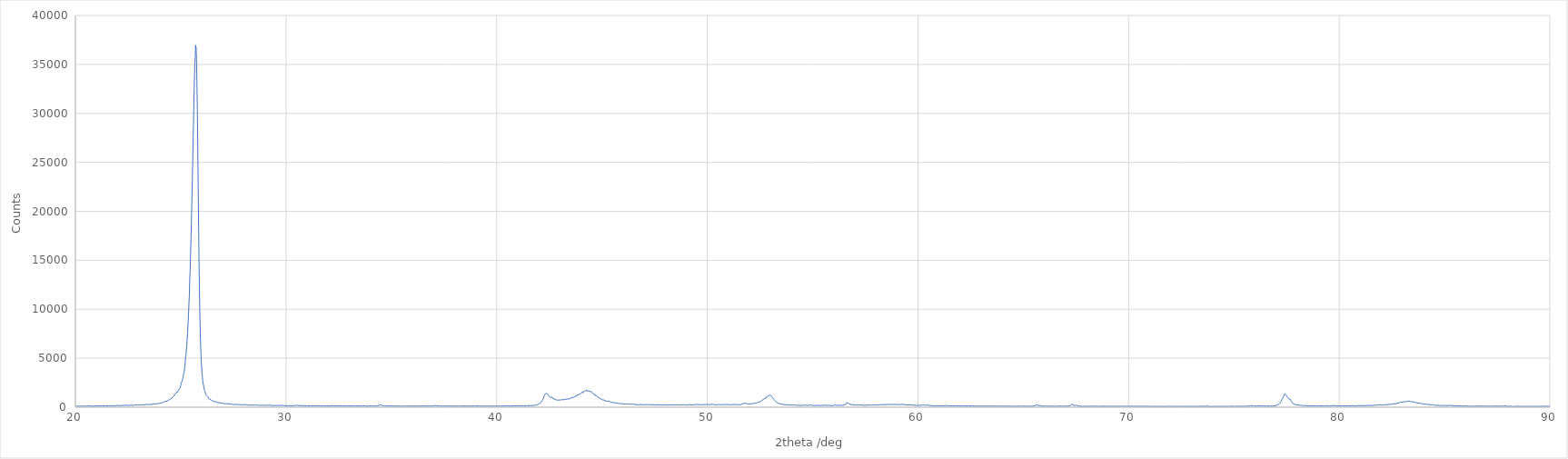
| Category | [Measurement conditions] |
|---|---|
| 20.01 | 100 |
| 20.03 | 119 |
| 20.05 | 104 |
| 20.07 | 100 |
| 20.09 | 97 |
| 20.11 | 107 |
| 20.13 | 111 |
| 20.15 | 119 |
| 20.17 | 114 |
| 20.19 | 95 |
| 20.21 | 114 |
| 20.23 | 109 |
| 20.25 | 108 |
| 20.27 | 118 |
| 20.29 | 110 |
| 20.31 | 104 |
| 20.33 | 119 |
| 20.35 | 124 |
| 20.37 | 110 |
| 20.39 | 112 |
| 20.41 | 109 |
| 20.43 | 108 |
| 20.45 | 116 |
| 20.47 | 116 |
| 20.49 | 112 |
| 20.51 | 124 |
| 20.53 | 116 |
| 20.55 | 118 |
| 20.57 | 122 |
| 20.59 | 120 |
| 20.61 | 127 |
| 20.63 | 111 |
| 20.65 | 111 |
| 20.67 | 140 |
| 20.69 | 94 |
| 20.71 | 104 |
| 20.73 | 120 |
| 20.75 | 124 |
| 20.77 | 104 |
| 20.79 | 112 |
| 20.81 | 121 |
| 20.83 | 124 |
| 20.85 | 101 |
| 20.87 | 110 |
| 20.89 | 126 |
| 20.91 | 131 |
| 20.93 | 131 |
| 20.95 | 137 |
| 20.97 | 137 |
| 20.99 | 138 |
| 21.01 | 127 |
| 21.03 | 133 |
| 21.05 | 108 |
| 21.07 | 126 |
| 21.09 | 129 |
| 21.11 | 141 |
| 21.13 | 162 |
| 21.15 | 130 |
| 21.17 | 116 |
| 21.19 | 126 |
| 21.21 | 135 |
| 21.23 | 138 |
| 21.25 | 140 |
| 21.27 | 138 |
| 21.29 | 144 |
| 21.31 | 130 |
| 21.33 | 149 |
| 21.35 | 144 |
| 21.37 | 136 |
| 21.39 | 143 |
| 21.41 | 134 |
| 21.43 | 130 |
| 21.45 | 149 |
| 21.47 | 131 |
| 21.49 | 139 |
| 21.51 | 129 |
| 21.53 | 164 |
| 21.55 | 135 |
| 21.57 | 132 |
| 21.59 | 150 |
| 21.61 | 140 |
| 21.63 | 133 |
| 21.65 | 133 |
| 21.67 | 155 |
| 21.69 | 158 |
| 21.71 | 154 |
| 21.73 | 169 |
| 21.75 | 151 |
| 21.77 | 165 |
| 21.79 | 153 |
| 21.81 | 151 |
| 21.83 | 148 |
| 21.85 | 135 |
| 21.87 | 141 |
| 21.89 | 146 |
| 21.91 | 162 |
| 21.93 | 162 |
| 21.95 | 179 |
| 21.97 | 144 |
| 21.99 | 187 |
| 22.01 | 144 |
| 22.03 | 152 |
| 22.05 | 159 |
| 22.07 | 139 |
| 22.09 | 185 |
| 22.11 | 164 |
| 22.13 | 171 |
| 22.15 | 165 |
| 22.17 | 165 |
| 22.19 | 166 |
| 22.21 | 186 |
| 22.23 | 177 |
| 22.25 | 176 |
| 22.27 | 154 |
| 22.29 | 176 |
| 22.31 | 187 |
| 22.33 | 185 |
| 22.35 | 193 |
| 22.37 | 160 |
| 22.39 | 163 |
| 22.41 | 197 |
| 22.43 | 175 |
| 22.45 | 171 |
| 22.47 | 176 |
| 22.49 | 205 |
| 22.51 | 194 |
| 22.53 | 172 |
| 22.55 | 178 |
| 22.57 | 182 |
| 22.59 | 203 |
| 22.61 | 195 |
| 22.63 | 199 |
| 22.65 | 204 |
| 22.67 | 214 |
| 22.69 | 213 |
| 22.71 | 187 |
| 22.73 | 229 |
| 22.75 | 227 |
| 22.77 | 187 |
| 22.79 | 196 |
| 22.81 | 213 |
| 22.83 | 247 |
| 22.85 | 228 |
| 22.87 | 226 |
| 22.89 | 218 |
| 22.91 | 214 |
| 22.93 | 226 |
| 22.95 | 230 |
| 22.97 | 277 |
| 22.99 | 211 |
| 23.01 | 226 |
| 23.03 | 228 |
| 23.05 | 236 |
| 23.07 | 227 |
| 23.09 | 259 |
| 23.11 | 269 |
| 23.13 | 240 |
| 23.15 | 263 |
| 23.17 | 222 |
| 23.19 | 255 |
| 23.21 | 268 |
| 23.23 | 262 |
| 23.25 | 240 |
| 23.27 | 260 |
| 23.29 | 276 |
| 23.31 | 263 |
| 23.33 | 261 |
| 23.35 | 244 |
| 23.37 | 292 |
| 23.39 | 245 |
| 23.41 | 271 |
| 23.43 | 260 |
| 23.45 | 253 |
| 23.47 | 269 |
| 23.49 | 264 |
| 23.51 | 297 |
| 23.53 | 262 |
| 23.55 | 288 |
| 23.57 | 294 |
| 23.59 | 269 |
| 23.61 | 278 |
| 23.63 | 286 |
| 23.65 | 318 |
| 23.67 | 319 |
| 23.69 | 358 |
| 23.71 | 335 |
| 23.73 | 362 |
| 23.75 | 347 |
| 23.77 | 347 |
| 23.79 | 321 |
| 23.81 | 333 |
| 23.83 | 370 |
| 23.85 | 355 |
| 23.87 | 402 |
| 23.89 | 367 |
| 23.91 | 346 |
| 23.93 | 393 |
| 23.95 | 426 |
| 23.97 | 387 |
| 23.99 | 412 |
| 24.01 | 412 |
| 24.03 | 409 |
| 24.05 | 395 |
| 24.07 | 427 |
| 24.09 | 433 |
| 24.11 | 459 |
| 24.13 | 504 |
| 24.15 | 487 |
| 24.17 | 434 |
| 24.19 | 497 |
| 24.21 | 532 |
| 24.23 | 526 |
| 24.25 | 508 |
| 24.27 | 591 |
| 24.29 | 543 |
| 24.31 | 614 |
| 24.33 | 613 |
| 24.35 | 620 |
| 24.37 | 662 |
| 24.39 | 678 |
| 24.41 | 710 |
| 24.43 | 753 |
| 24.45 | 758 |
| 24.47 | 754 |
| 24.49 | 773 |
| 24.51 | 820 |
| 24.53 | 845 |
| 24.55 | 912 |
| 24.57 | 922 |
| 24.59 | 951 |
| 24.61 | 987 |
| 24.63 | 1048 |
| 24.65 | 1128 |
| 24.67 | 1146 |
| 24.69 | 1217 |
| 24.71 | 1240 |
| 24.73 | 1336 |
| 24.75 | 1358 |
| 24.77 | 1365 |
| 24.79 | 1507 |
| 24.81 | 1575 |
| 24.83 | 1573 |
| 24.85 | 1535 |
| 24.87 | 1593 |
| 24.89 | 1741 |
| 24.91 | 1757 |
| 24.93 | 1862 |
| 24.95 | 1945 |
| 24.97 | 1970 |
| 24.99 | 2146 |
| 25.01 | 2261 |
| 25.03 | 2454 |
| 25.05 | 2522 |
| 25.07 | 2720 |
| 25.09 | 2877 |
| 25.11 | 3019 |
| 25.13 | 3351 |
| 25.15 | 3506 |
| 25.17 | 3663 |
| 25.19 | 4078 |
| 25.21 | 4454 |
| 25.23 | 5103 |
| 25.25 | 5347 |
| 25.27 | 5928 |
| 25.29 | 6325 |
| 25.31 | 7133 |
| 25.33 | 7672 |
| 25.35 | 8624 |
| 25.37 | 9398 |
| 25.39 | 10587 |
| 25.41 | 11391 |
| 25.43 | 13116 |
| 25.45 | 14067 |
| 25.47 | 15976 |
| 25.49 | 17316 |
| 25.51 | 19129 |
| 25.53 | 21165 |
| 25.55 | 23058 |
| 25.57 | 25038 |
| 25.59 | 27614 |
| 25.61 | 29217 |
| 25.63 | 31694 |
| 25.65 | 33254 |
| 25.67 | 35062 |
| 25.69 | 35752 |
| 25.71 | 36962 |
| 25.73 | 36573 |
| 25.75 | 35511 |
| 25.77 | 33069 |
| 25.79 | 30374 |
| 25.81 | 26295 |
| 25.83 | 22354 |
| 25.85 | 18491 |
| 25.87 | 14773 |
| 25.89 | 11864 |
| 25.91 | 9457 |
| 25.93 | 7427 |
| 25.95 | 6044 |
| 25.97 | 4993 |
| 25.99 | 4187 |
| 26.01 | 3417 |
| 26.03 | 3110 |
| 26.05 | 2610 |
| 26.07 | 2356 |
| 26.09 | 2163 |
| 26.11 | 1873 |
| 26.13 | 1746 |
| 26.15 | 1603 |
| 26.17 | 1477 |
| 26.19 | 1381 |
| 26.21 | 1247 |
| 26.23 | 1232 |
| 26.25 | 1147 |
| 26.27 | 1061 |
| 26.29 | 1040 |
| 26.31 | 1001 |
| 26.33 | 911 |
| 26.35 | 876 |
| 26.37 | 808 |
| 26.39 | 854 |
| 26.41 | 824 |
| 26.43 | 772 |
| 26.45 | 732 |
| 26.47 | 675 |
| 26.49 | 695 |
| 26.51 | 695 |
| 26.53 | 632 |
| 26.55 | 629 |
| 26.57 | 620 |
| 26.59 | 554 |
| 26.61 | 539 |
| 26.63 | 582 |
| 26.65 | 564 |
| 26.67 | 500 |
| 26.69 | 551 |
| 26.71 | 522 |
| 26.73 | 517 |
| 26.75 | 472 |
| 26.77 | 460 |
| 26.79 | 481 |
| 26.81 | 472 |
| 26.83 | 444 |
| 26.85 | 484 |
| 26.87 | 452 |
| 26.89 | 439 |
| 26.91 | 429 |
| 26.93 | 415 |
| 26.95 | 407 |
| 26.97 | 410 |
| 26.99 | 396 |
| 27.01 | 402 |
| 27.03 | 370 |
| 27.05 | 332 |
| 27.07 | 362 |
| 27.09 | 366 |
| 27.11 | 393 |
| 27.13 | 339 |
| 27.15 | 364 |
| 27.17 | 379 |
| 27.19 | 378 |
| 27.21 | 384 |
| 27.23 | 337 |
| 27.25 | 330 |
| 27.27 | 347 |
| 27.29 | 335 |
| 27.31 | 352 |
| 27.33 | 322 |
| 27.35 | 295 |
| 27.37 | 321 |
| 27.39 | 332 |
| 27.41 | 338 |
| 27.43 | 300 |
| 27.45 | 279 |
| 27.47 | 329 |
| 27.49 | 264 |
| 27.51 | 293 |
| 27.53 | 262 |
| 27.55 | 278 |
| 27.57 | 275 |
| 27.59 | 292 |
| 27.61 | 273 |
| 27.63 | 273 |
| 27.65 | 273 |
| 27.67 | 296 |
| 27.69 | 288 |
| 27.71 | 254 |
| 27.73 | 240 |
| 27.75 | 253 |
| 27.77 | 267 |
| 27.79 | 261 |
| 27.81 | 270 |
| 27.83 | 264 |
| 27.85 | 267 |
| 27.87 | 278 |
| 27.89 | 237 |
| 27.91 | 219 |
| 27.93 | 280 |
| 27.95 | 248 |
| 27.97 | 250 |
| 27.99 | 273 |
| 28.01 | 220 |
| 28.03 | 257 |
| 28.05 | 238 |
| 28.07 | 230 |
| 28.09 | 264 |
| 28.11 | 248 |
| 28.13 | 227 |
| 28.15 | 231 |
| 28.17 | 216 |
| 28.19 | 213 |
| 28.21 | 212 |
| 28.23 | 217 |
| 28.25 | 206 |
| 28.27 | 193 |
| 28.29 | 219 |
| 28.31 | 235 |
| 28.33 | 222 |
| 28.35 | 194 |
| 28.37 | 237 |
| 28.39 | 206 |
| 28.41 | 221 |
| 28.43 | 196 |
| 28.45 | 201 |
| 28.47 | 219 |
| 28.49 | 229 |
| 28.51 | 228 |
| 28.53 | 204 |
| 28.55 | 205 |
| 28.57 | 213 |
| 28.59 | 207 |
| 28.61 | 215 |
| 28.63 | 214 |
| 28.65 | 231 |
| 28.67 | 199 |
| 28.69 | 200 |
| 28.71 | 198 |
| 28.73 | 182 |
| 28.75 | 171 |
| 28.77 | 230 |
| 28.79 | 194 |
| 28.81 | 205 |
| 28.83 | 202 |
| 28.85 | 202 |
| 28.87 | 213 |
| 28.89 | 200 |
| 28.91 | 221 |
| 28.93 | 183 |
| 28.95 | 209 |
| 28.97 | 200 |
| 28.99 | 205 |
| 29.01 | 210 |
| 29.03 | 195 |
| 29.05 | 179 |
| 29.07 | 185 |
| 29.09 | 173 |
| 29.11 | 198 |
| 29.13 | 144 |
| 29.15 | 198 |
| 29.17 | 206 |
| 29.19 | 174 |
| 29.21 | 189 |
| 29.23 | 203 |
| 29.25 | 179 |
| 29.27 | 158 |
| 29.29 | 192 |
| 29.31 | 171 |
| 29.33 | 174 |
| 29.35 | 161 |
| 29.37 | 177 |
| 29.39 | 170 |
| 29.41 | 173 |
| 29.43 | 149 |
| 29.45 | 173 |
| 29.47 | 157 |
| 29.49 | 177 |
| 29.51 | 186 |
| 29.53 | 195 |
| 29.55 | 177 |
| 29.57 | 164 |
| 29.59 | 157 |
| 29.61 | 193 |
| 29.63 | 178 |
| 29.65 | 179 |
| 29.67 | 134 |
| 29.69 | 147 |
| 29.71 | 155 |
| 29.73 | 164 |
| 29.75 | 171 |
| 29.77 | 194 |
| 29.79 | 176 |
| 29.81 | 164 |
| 29.83 | 189 |
| 29.85 | 170 |
| 29.87 | 159 |
| 29.89 | 171 |
| 29.91 | 163 |
| 29.93 | 172 |
| 29.95 | 161 |
| 29.97 | 149 |
| 29.99 | 144 |
| 30.01 | 139 |
| 30.03 | 150 |
| 30.05 | 159 |
| 30.07 | 149 |
| 30.09 | 151 |
| 30.11 | 159 |
| 30.13 | 149 |
| 30.15 | 173 |
| 30.17 | 139 |
| 30.19 | 164 |
| 30.21 | 145 |
| 30.23 | 152 |
| 30.25 | 142 |
| 30.27 | 147 |
| 30.29 | 179 |
| 30.31 | 165 |
| 30.33 | 149 |
| 30.35 | 160 |
| 30.37 | 142 |
| 30.39 | 120 |
| 30.41 | 168 |
| 30.43 | 187 |
| 30.45 | 144 |
| 30.47 | 163 |
| 30.49 | 177 |
| 30.51 | 142 |
| 30.53 | 143 |
| 30.55 | 189 |
| 30.57 | 141 |
| 30.59 | 158 |
| 30.61 | 165 |
| 30.63 | 149 |
| 30.65 | 141 |
| 30.67 | 175 |
| 30.69 | 165 |
| 30.71 | 149 |
| 30.73 | 133 |
| 30.75 | 132 |
| 30.77 | 142 |
| 30.79 | 162 |
| 30.81 | 163 |
| 30.83 | 149 |
| 30.85 | 168 |
| 30.87 | 126 |
| 30.89 | 145 |
| 30.91 | 132 |
| 30.93 | 145 |
| 30.95 | 135 |
| 30.97 | 142 |
| 30.99 | 146 |
| 31.01 | 134 |
| 31.03 | 132 |
| 31.05 | 144 |
| 31.07 | 149 |
| 31.09 | 154 |
| 31.11 | 151 |
| 31.13 | 137 |
| 31.15 | 137 |
| 31.17 | 133 |
| 31.19 | 146 |
| 31.21 | 136 |
| 31.23 | 151 |
| 31.25 | 135 |
| 31.27 | 140 |
| 31.29 | 144 |
| 31.31 | 145 |
| 31.33 | 159 |
| 31.35 | 140 |
| 31.37 | 130 |
| 31.39 | 136 |
| 31.41 | 141 |
| 31.43 | 163 |
| 31.45 | 139 |
| 31.47 | 141 |
| 31.49 | 143 |
| 31.51 | 155 |
| 31.53 | 132 |
| 31.55 | 123 |
| 31.57 | 138 |
| 31.59 | 146 |
| 31.61 | 120 |
| 31.63 | 149 |
| 31.65 | 132 |
| 31.67 | 157 |
| 31.69 | 128 |
| 31.71 | 117 |
| 31.73 | 161 |
| 31.75 | 129 |
| 31.77 | 167 |
| 31.79 | 122 |
| 31.81 | 131 |
| 31.83 | 135 |
| 31.85 | 146 |
| 31.87 | 128 |
| 31.89 | 160 |
| 31.91 | 134 |
| 31.93 | 133 |
| 31.95 | 145 |
| 31.97 | 127 |
| 31.99 | 132 |
| 32.01 | 128 |
| 32.03 | 122 |
| 32.05 | 111 |
| 32.07 | 130 |
| 32.09 | 143 |
| 32.11 | 143 |
| 32.13 | 119 |
| 32.15 | 159 |
| 32.17 | 163 |
| 32.19 | 121 |
| 32.21 | 139 |
| 32.23 | 131 |
| 32.25 | 122 |
| 32.27 | 131 |
| 32.29 | 140 |
| 32.31 | 135 |
| 32.33 | 125 |
| 32.35 | 152 |
| 32.37 | 133 |
| 32.39 | 147 |
| 32.41 | 137 |
| 32.43 | 141 |
| 32.45 | 125 |
| 32.47 | 125 |
| 32.49 | 108 |
| 32.51 | 129 |
| 32.53 | 126 |
| 32.55 | 117 |
| 32.57 | 117 |
| 32.59 | 150 |
| 32.61 | 134 |
| 32.63 | 134 |
| 32.65 | 106 |
| 32.67 | 128 |
| 32.69 | 125 |
| 32.71 | 131 |
| 32.73 | 160 |
| 32.75 | 137 |
| 32.77 | 151 |
| 32.79 | 124 |
| 32.81 | 137 |
| 32.83 | 109 |
| 32.85 | 126 |
| 32.87 | 126 |
| 32.89 | 130 |
| 32.91 | 143 |
| 32.93 | 152 |
| 32.95 | 130 |
| 32.97 | 118 |
| 32.99 | 110 |
| 33.01 | 135 |
| 33.03 | 134 |
| 33.05 | 115 |
| 33.07 | 140 |
| 33.09 | 122 |
| 33.11 | 143 |
| 33.13 | 108 |
| 33.15 | 123 |
| 33.17 | 132 |
| 33.19 | 133 |
| 33.21 | 101 |
| 33.23 | 120 |
| 33.25 | 110 |
| 33.27 | 141 |
| 33.29 | 129 |
| 33.31 | 136 |
| 33.33 | 123 |
| 33.35 | 128 |
| 33.37 | 127 |
| 33.39 | 124 |
| 33.41 | 117 |
| 33.43 | 130 |
| 33.45 | 101 |
| 33.47 | 118 |
| 33.49 | 141 |
| 33.51 | 104 |
| 33.53 | 132 |
| 33.55 | 124 |
| 33.57 | 116 |
| 33.59 | 121 |
| 33.61 | 105 |
| 33.63 | 120 |
| 33.65 | 115 |
| 33.67 | 136 |
| 33.69 | 143 |
| 33.71 | 128 |
| 33.73 | 142 |
| 33.75 | 115 |
| 33.77 | 131 |
| 33.79 | 118 |
| 33.81 | 114 |
| 33.83 | 129 |
| 33.85 | 113 |
| 33.87 | 121 |
| 33.89 | 117 |
| 33.91 | 100 |
| 33.93 | 139 |
| 33.95 | 139 |
| 33.97 | 122 |
| 33.99 | 124 |
| 34.01 | 133 |
| 34.03 | 145 |
| 34.05 | 135 |
| 34.07 | 113 |
| 34.09 | 115 |
| 34.11 | 100 |
| 34.13 | 124 |
| 34.15 | 118 |
| 34.17 | 129 |
| 34.19 | 136 |
| 34.21 | 117 |
| 34.23 | 133 |
| 34.25 | 119 |
| 34.27 | 125 |
| 34.29 | 133 |
| 34.31 | 157 |
| 34.33 | 148 |
| 34.35 | 134 |
| 34.37 | 148 |
| 34.39 | 171 |
| 34.41 | 177 |
| 34.43 | 201 |
| 34.45 | 223 |
| 34.47 | 217 |
| 34.49 | 221 |
| 34.51 | 218 |
| 34.53 | 206 |
| 34.55 | 191 |
| 34.57 | 177 |
| 34.59 | 154 |
| 34.61 | 151 |
| 34.63 | 160 |
| 34.65 | 129 |
| 34.67 | 133 |
| 34.69 | 122 |
| 34.71 | 135 |
| 34.73 | 131 |
| 34.75 | 120 |
| 34.77 | 114 |
| 34.79 | 112 |
| 34.81 | 109 |
| 34.83 | 142 |
| 34.85 | 121 |
| 34.87 | 128 |
| 34.89 | 109 |
| 34.91 | 127 |
| 34.93 | 139 |
| 34.95 | 129 |
| 34.97 | 110 |
| 34.99 | 136 |
| 35.01 | 106 |
| 35.03 | 127 |
| 35.05 | 116 |
| 35.07 | 134 |
| 35.09 | 103 |
| 35.11 | 124 |
| 35.13 | 117 |
| 35.15 | 122 |
| 35.17 | 112 |
| 35.19 | 127 |
| 35.21 | 109 |
| 35.23 | 111 |
| 35.25 | 130 |
| 35.27 | 119 |
| 35.29 | 134 |
| 35.31 | 136 |
| 35.33 | 127 |
| 35.35 | 125 |
| 35.37 | 129 |
| 35.39 | 121 |
| 35.41 | 92 |
| 35.43 | 121 |
| 35.45 | 113 |
| 35.47 | 112 |
| 35.49 | 112 |
| 35.51 | 128 |
| 35.53 | 104 |
| 35.55 | 117 |
| 35.57 | 133 |
| 35.59 | 108 |
| 35.61 | 121 |
| 35.63 | 126 |
| 35.65 | 118 |
| 35.67 | 121 |
| 35.69 | 125 |
| 35.71 | 114 |
| 35.73 | 121 |
| 35.75 | 102 |
| 35.77 | 130 |
| 35.79 | 123 |
| 35.81 | 102 |
| 35.83 | 115 |
| 35.85 | 136 |
| 35.87 | 145 |
| 35.89 | 104 |
| 35.91 | 124 |
| 35.93 | 111 |
| 35.95 | 121 |
| 35.97 | 108 |
| 35.99 | 132 |
| 36.01 | 113 |
| 36.03 | 146 |
| 36.05 | 125 |
| 36.07 | 118 |
| 36.09 | 136 |
| 36.11 | 132 |
| 36.13 | 111 |
| 36.15 | 134 |
| 36.17 | 114 |
| 36.19 | 126 |
| 36.21 | 125 |
| 36.23 | 117 |
| 36.25 | 104 |
| 36.27 | 136 |
| 36.29 | 122 |
| 36.31 | 106 |
| 36.33 | 116 |
| 36.35 | 112 |
| 36.37 | 126 |
| 36.39 | 139 |
| 36.41 | 120 |
| 36.43 | 131 |
| 36.45 | 131 |
| 36.47 | 127 |
| 36.49 | 133 |
| 36.51 | 107 |
| 36.53 | 115 |
| 36.55 | 126 |
| 36.57 | 104 |
| 36.59 | 136 |
| 36.61 | 120 |
| 36.63 | 137 |
| 36.65 | 115 |
| 36.67 | 112 |
| 36.69 | 136 |
| 36.71 | 120 |
| 36.73 | 120 |
| 36.75 | 132 |
| 36.77 | 119 |
| 36.79 | 111 |
| 36.81 | 116 |
| 36.83 | 124 |
| 36.85 | 149 |
| 36.87 | 116 |
| 36.89 | 125 |
| 36.91 | 118 |
| 36.93 | 110 |
| 36.95 | 127 |
| 36.97 | 122 |
| 36.99 | 121 |
| 37.01 | 150 |
| 37.03 | 144 |
| 37.05 | 144 |
| 37.07 | 181 |
| 37.09 | 186 |
| 37.11 | 185 |
| 37.13 | 171 |
| 37.15 | 162 |
| 37.17 | 182 |
| 37.19 | 156 |
| 37.21 | 138 |
| 37.23 | 141 |
| 37.25 | 150 |
| 37.27 | 118 |
| 37.29 | 140 |
| 37.31 | 120 |
| 37.33 | 133 |
| 37.35 | 117 |
| 37.37 | 110 |
| 37.39 | 114 |
| 37.41 | 116 |
| 37.43 | 110 |
| 37.45 | 116 |
| 37.47 | 121 |
| 37.49 | 108 |
| 37.51 | 115 |
| 37.53 | 113 |
| 37.55 | 115 |
| 37.57 | 120 |
| 37.59 | 115 |
| 37.61 | 104 |
| 37.63 | 124 |
| 37.65 | 106 |
| 37.67 | 104 |
| 37.69 | 113 |
| 37.71 | 114 |
| 37.73 | 121 |
| 37.75 | 125 |
| 37.77 | 111 |
| 37.79 | 116 |
| 37.81 | 125 |
| 37.83 | 105 |
| 37.85 | 121 |
| 37.87 | 123 |
| 37.89 | 116 |
| 37.91 | 134 |
| 37.93 | 110 |
| 37.95 | 112 |
| 37.97 | 117 |
| 37.99 | 107 |
| 38.01 | 107 |
| 38.03 | 127 |
| 38.05 | 133 |
| 38.07 | 132 |
| 38.09 | 130 |
| 38.11 | 115 |
| 38.13 | 128 |
| 38.15 | 103 |
| 38.17 | 86 |
| 38.19 | 119 |
| 38.21 | 101 |
| 38.23 | 130 |
| 38.25 | 119 |
| 38.27 | 120 |
| 38.29 | 104 |
| 38.31 | 122 |
| 38.33 | 104 |
| 38.35 | 117 |
| 38.37 | 135 |
| 38.39 | 104 |
| 38.41 | 139 |
| 38.43 | 125 |
| 38.45 | 122 |
| 38.47 | 110 |
| 38.49 | 116 |
| 38.51 | 136 |
| 38.53 | 130 |
| 38.55 | 130 |
| 38.57 | 95 |
| 38.59 | 110 |
| 38.61 | 123 |
| 38.63 | 130 |
| 38.65 | 103 |
| 38.67 | 130 |
| 38.69 | 130 |
| 38.71 | 122 |
| 38.73 | 127 |
| 38.75 | 112 |
| 38.77 | 124 |
| 38.79 | 105 |
| 38.81 | 120 |
| 38.83 | 121 |
| 38.85 | 124 |
| 38.87 | 114 |
| 38.89 | 124 |
| 38.91 | 130 |
| 38.93 | 124 |
| 38.95 | 124 |
| 38.97 | 121 |
| 38.99 | 115 |
| 39.01 | 105 |
| 39.03 | 131 |
| 39.05 | 115 |
| 39.07 | 153 |
| 39.09 | 119 |
| 39.11 | 116 |
| 39.13 | 127 |
| 39.15 | 125 |
| 39.17 | 123 |
| 39.19 | 108 |
| 39.21 | 106 |
| 39.23 | 114 |
| 39.25 | 100 |
| 39.27 | 121 |
| 39.29 | 112 |
| 39.31 | 114 |
| 39.33 | 127 |
| 39.35 | 129 |
| 39.37 | 110 |
| 39.39 | 116 |
| 39.41 | 114 |
| 39.43 | 115 |
| 39.45 | 132 |
| 39.47 | 118 |
| 39.49 | 120 |
| 39.51 | 124 |
| 39.53 | 120 |
| 39.55 | 105 |
| 39.57 | 138 |
| 39.59 | 140 |
| 39.61 | 126 |
| 39.63 | 107 |
| 39.65 | 117 |
| 39.67 | 97 |
| 39.69 | 118 |
| 39.71 | 112 |
| 39.73 | 127 |
| 39.75 | 122 |
| 39.77 | 128 |
| 39.79 | 109 |
| 39.81 | 111 |
| 39.83 | 117 |
| 39.85 | 124 |
| 39.87 | 121 |
| 39.89 | 111 |
| 39.91 | 115 |
| 39.93 | 119 |
| 39.95 | 127 |
| 39.97 | 96 |
| 39.99 | 112 |
| 40.01 | 107 |
| 40.03 | 118 |
| 40.05 | 116 |
| 40.07 | 115 |
| 40.09 | 115 |
| 40.11 | 123 |
| 40.13 | 149 |
| 40.15 | 110 |
| 40.17 | 134 |
| 40.19 | 119 |
| 40.21 | 113 |
| 40.23 | 121 |
| 40.25 | 114 |
| 40.27 | 126 |
| 40.29 | 150 |
| 40.31 | 111 |
| 40.33 | 103 |
| 40.35 | 150 |
| 40.37 | 120 |
| 40.39 | 124 |
| 40.41 | 145 |
| 40.43 | 125 |
| 40.45 | 132 |
| 40.47 | 135 |
| 40.49 | 129 |
| 40.51 | 145 |
| 40.53 | 126 |
| 40.55 | 126 |
| 40.57 | 130 |
| 40.59 | 106 |
| 40.61 | 132 |
| 40.63 | 108 |
| 40.65 | 149 |
| 40.67 | 145 |
| 40.69 | 126 |
| 40.71 | 129 |
| 40.73 | 137 |
| 40.75 | 128 |
| 40.77 | 140 |
| 40.79 | 136 |
| 40.81 | 145 |
| 40.83 | 142 |
| 40.85 | 133 |
| 40.87 | 136 |
| 40.89 | 153 |
| 40.91 | 163 |
| 40.93 | 134 |
| 40.95 | 139 |
| 40.97 | 136 |
| 40.99 | 154 |
| 41.01 | 139 |
| 41.03 | 143 |
| 41.05 | 141 |
| 41.07 | 124 |
| 41.09 | 157 |
| 41.11 | 145 |
| 41.13 | 142 |
| 41.15 | 138 |
| 41.17 | 139 |
| 41.19 | 130 |
| 41.21 | 163 |
| 41.23 | 145 |
| 41.25 | 126 |
| 41.27 | 158 |
| 41.29 | 143 |
| 41.31 | 142 |
| 41.33 | 154 |
| 41.35 | 150 |
| 41.37 | 121 |
| 41.39 | 148 |
| 41.41 | 138 |
| 41.43 | 154 |
| 41.45 | 157 |
| 41.47 | 161 |
| 41.49 | 159 |
| 41.51 | 146 |
| 41.53 | 155 |
| 41.55 | 159 |
| 41.57 | 156 |
| 41.59 | 161 |
| 41.61 | 163 |
| 41.63 | 171 |
| 41.65 | 163 |
| 41.67 | 169 |
| 41.69 | 167 |
| 41.71 | 177 |
| 41.73 | 152 |
| 41.75 | 200 |
| 41.77 | 173 |
| 41.79 | 185 |
| 41.81 | 211 |
| 41.83 | 208 |
| 41.85 | 183 |
| 41.87 | 189 |
| 41.89 | 220 |
| 41.91 | 223 |
| 41.93 | 221 |
| 41.95 | 275 |
| 41.97 | 269 |
| 41.99 | 305 |
| 42.01 | 354 |
| 42.03 | 318 |
| 42.05 | 392 |
| 42.07 | 401 |
| 42.09 | 435 |
| 42.11 | 527 |
| 42.13 | 595 |
| 42.15 | 664 |
| 42.17 | 713 |
| 42.19 | 796 |
| 42.21 | 869 |
| 42.23 | 1008 |
| 42.25 | 1104 |
| 42.27 | 1237 |
| 42.29 | 1300 |
| 42.31 | 1366 |
| 42.33 | 1457 |
| 42.35 | 1405 |
| 42.37 | 1418 |
| 42.39 | 1410 |
| 42.41 | 1331 |
| 42.43 | 1279 |
| 42.45 | 1179 |
| 42.47 | 1118 |
| 42.49 | 1087 |
| 42.51 | 1075 |
| 42.53 | 992 |
| 42.55 | 998 |
| 42.57 | 1006 |
| 42.59 | 1001 |
| 42.61 | 992 |
| 42.63 | 1029 |
| 42.65 | 998 |
| 42.67 | 883 |
| 42.69 | 865 |
| 42.71 | 857 |
| 42.73 | 871 |
| 42.75 | 778 |
| 42.77 | 793 |
| 42.79 | 815 |
| 42.81 | 773 |
| 42.83 | 721 |
| 42.85 | 748 |
| 42.87 | 716 |
| 42.89 | 726 |
| 42.91 | 694 |
| 42.93 | 731 |
| 42.95 | 768 |
| 42.97 | 730 |
| 42.99 | 733 |
| 43.01 | 719 |
| 43.03 | 735 |
| 43.05 | 741 |
| 43.07 | 742 |
| 43.09 | 728 |
| 43.11 | 784 |
| 43.13 | 778 |
| 43.15 | 797 |
| 43.17 | 750 |
| 43.19 | 779 |
| 43.21 | 807 |
| 43.23 | 803 |
| 43.25 | 750 |
| 43.27 | 778 |
| 43.29 | 811 |
| 43.31 | 862 |
| 43.33 | 859 |
| 43.35 | 839 |
| 43.37 | 880 |
| 43.39 | 852 |
| 43.41 | 829 |
| 43.43 | 880 |
| 43.45 | 886 |
| 43.47 | 880 |
| 43.49 | 863 |
| 43.51 | 890 |
| 43.53 | 924 |
| 43.55 | 948 |
| 43.57 | 995 |
| 43.59 | 996 |
| 43.61 | 979 |
| 43.63 | 991 |
| 43.65 | 1004 |
| 43.67 | 1057 |
| 43.69 | 1011 |
| 43.71 | 1081 |
| 43.73 | 1078 |
| 43.75 | 1106 |
| 43.77 | 1109 |
| 43.79 | 1212 |
| 43.81 | 1203 |
| 43.83 | 1204 |
| 43.85 | 1208 |
| 43.87 | 1226 |
| 43.89 | 1309 |
| 43.91 | 1319 |
| 43.93 | 1341 |
| 43.95 | 1324 |
| 43.97 | 1390 |
| 43.99 | 1366 |
| 44.01 | 1436 |
| 44.03 | 1409 |
| 44.05 | 1424 |
| 44.07 | 1566 |
| 44.09 | 1432 |
| 44.11 | 1555 |
| 44.13 | 1542 |
| 44.15 | 1505 |
| 44.17 | 1657 |
| 44.19 | 1606 |
| 44.21 | 1718 |
| 44.23 | 1633 |
| 44.25 | 1672 |
| 44.27 | 1771 |
| 44.29 | 1660 |
| 44.31 | 1702 |
| 44.33 | 1622 |
| 44.35 | 1661 |
| 44.37 | 1645 |
| 44.39 | 1664 |
| 44.41 | 1629 |
| 44.43 | 1703 |
| 44.45 | 1623 |
| 44.47 | 1586 |
| 44.49 | 1555 |
| 44.51 | 1548 |
| 44.53 | 1505 |
| 44.55 | 1484 |
| 44.57 | 1461 |
| 44.59 | 1360 |
| 44.61 | 1320 |
| 44.63 | 1321 |
| 44.65 | 1347 |
| 44.67 | 1186 |
| 44.69 | 1212 |
| 44.71 | 1197 |
| 44.73 | 1179 |
| 44.75 | 1099 |
| 44.77 | 1090 |
| 44.79 | 1041 |
| 44.81 | 1061 |
| 44.83 | 1012 |
| 44.85 | 982 |
| 44.87 | 951 |
| 44.89 | 931 |
| 44.91 | 898 |
| 44.93 | 885 |
| 44.95 | 863 |
| 44.97 | 833 |
| 44.99 | 831 |
| 45.01 | 766 |
| 45.03 | 739 |
| 45.05 | 748 |
| 45.07 | 741 |
| 45.09 | 735 |
| 45.11 | 719 |
| 45.13 | 735 |
| 45.15 | 666 |
| 45.17 | 667 |
| 45.19 | 649 |
| 45.21 | 627 |
| 45.23 | 658 |
| 45.25 | 606 |
| 45.27 | 602 |
| 45.29 | 619 |
| 45.31 | 557 |
| 45.33 | 614 |
| 45.35 | 537 |
| 45.37 | 563 |
| 45.39 | 551 |
| 45.41 | 549 |
| 45.43 | 545 |
| 45.45 | 497 |
| 45.47 | 491 |
| 45.49 | 483 |
| 45.51 | 480 |
| 45.53 | 459 |
| 45.55 | 507 |
| 45.57 | 462 |
| 45.59 | 440 |
| 45.61 | 423 |
| 45.63 | 447 |
| 45.65 | 429 |
| 45.67 | 434 |
| 45.69 | 396 |
| 45.71 | 423 |
| 45.73 | 387 |
| 45.75 | 442 |
| 45.77 | 432 |
| 45.79 | 402 |
| 45.81 | 343 |
| 45.83 | 397 |
| 45.85 | 356 |
| 45.87 | 386 |
| 45.89 | 399 |
| 45.91 | 378 |
| 45.93 | 356 |
| 45.95 | 368 |
| 45.97 | 365 |
| 45.99 | 356 |
| 46.01 | 356 |
| 46.03 | 366 |
| 46.05 | 306 |
| 46.07 | 344 |
| 46.09 | 340 |
| 46.11 | 341 |
| 46.13 | 367 |
| 46.15 | 353 |
| 46.17 | 312 |
| 46.19 | 329 |
| 46.21 | 319 |
| 46.23 | 328 |
| 46.25 | 312 |
| 46.27 | 318 |
| 46.29 | 325 |
| 46.31 | 316 |
| 46.33 | 308 |
| 46.35 | 305 |
| 46.37 | 310 |
| 46.39 | 281 |
| 46.41 | 299 |
| 46.43 | 292 |
| 46.45 | 298 |
| 46.47 | 309 |
| 46.49 | 289 |
| 46.51 | 299 |
| 46.53 | 284 |
| 46.55 | 305 |
| 46.57 | 261 |
| 46.59 | 270 |
| 46.61 | 276 |
| 46.63 | 271 |
| 46.65 | 250 |
| 46.67 | 252 |
| 46.69 | 330 |
| 46.71 | 238 |
| 46.73 | 246 |
| 46.75 | 293 |
| 46.77 | 263 |
| 46.79 | 247 |
| 46.81 | 278 |
| 46.83 | 277 |
| 46.85 | 281 |
| 46.87 | 261 |
| 46.89 | 266 |
| 46.91 | 264 |
| 46.93 | 265 |
| 46.95 | 241 |
| 46.97 | 262 |
| 46.99 | 229 |
| 47.01 | 255 |
| 47.03 | 269 |
| 47.05 | 272 |
| 47.07 | 262 |
| 47.09 | 236 |
| 47.11 | 244 |
| 47.13 | 259 |
| 47.15 | 208 |
| 47.17 | 254 |
| 47.19 | 275 |
| 47.21 | 275 |
| 47.23 | 285 |
| 47.25 | 245 |
| 47.27 | 260 |
| 47.29 | 260 |
| 47.31 | 258 |
| 47.33 | 216 |
| 47.35 | 228 |
| 47.37 | 242 |
| 47.39 | 231 |
| 47.41 | 243 |
| 47.43 | 249 |
| 47.45 | 272 |
| 47.47 | 230 |
| 47.49 | 236 |
| 47.51 | 238 |
| 47.53 | 259 |
| 47.55 | 255 |
| 47.57 | 269 |
| 47.59 | 222 |
| 47.61 | 231 |
| 47.63 | 230 |
| 47.65 | 233 |
| 47.67 | 266 |
| 47.69 | 247 |
| 47.71 | 231 |
| 47.73 | 229 |
| 47.75 | 225 |
| 47.77 | 270 |
| 47.79 | 235 |
| 47.81 | 253 |
| 47.83 | 232 |
| 47.85 | 224 |
| 47.87 | 241 |
| 47.89 | 223 |
| 47.91 | 230 |
| 47.93 | 236 |
| 47.95 | 242 |
| 47.97 | 235 |
| 47.99 | 211 |
| 48.01 | 225 |
| 48.03 | 240 |
| 48.05 | 217 |
| 48.07 | 218 |
| 48.09 | 234 |
| 48.11 | 249 |
| 48.13 | 245 |
| 48.15 | 213 |
| 48.17 | 236 |
| 48.19 | 231 |
| 48.21 | 236 |
| 48.23 | 228 |
| 48.25 | 217 |
| 48.27 | 230 |
| 48.29 | 221 |
| 48.31 | 215 |
| 48.33 | 237 |
| 48.35 | 244 |
| 48.37 | 238 |
| 48.39 | 246 |
| 48.41 | 211 |
| 48.43 | 225 |
| 48.45 | 224 |
| 48.47 | 235 |
| 48.49 | 228 |
| 48.51 | 246 |
| 48.53 | 249 |
| 48.55 | 218 |
| 48.57 | 248 |
| 48.59 | 223 |
| 48.61 | 213 |
| 48.63 | 222 |
| 48.65 | 220 |
| 48.67 | 215 |
| 48.69 | 212 |
| 48.71 | 231 |
| 48.73 | 211 |
| 48.75 | 247 |
| 48.77 | 229 |
| 48.79 | 235 |
| 48.81 | 237 |
| 48.83 | 236 |
| 48.85 | 221 |
| 48.87 | 247 |
| 48.89 | 235 |
| 48.91 | 229 |
| 48.93 | 232 |
| 48.95 | 229 |
| 48.97 | 257 |
| 48.99 | 224 |
| 49.01 | 247 |
| 49.03 | 249 |
| 49.05 | 238 |
| 49.07 | 211 |
| 49.09 | 246 |
| 49.11 | 254 |
| 49.13 | 231 |
| 49.15 | 259 |
| 49.17 | 272 |
| 49.19 | 250 |
| 49.21 | 250 |
| 49.23 | 222 |
| 49.25 | 258 |
| 49.27 | 260 |
| 49.29 | 235 |
| 49.31 | 278 |
| 49.33 | 248 |
| 49.35 | 253 |
| 49.37 | 253 |
| 49.39 | 216 |
| 49.41 | 248 |
| 49.43 | 257 |
| 49.45 | 226 |
| 49.47 | 264 |
| 49.49 | 264 |
| 49.51 | 244 |
| 49.53 | 273 |
| 49.55 | 247 |
| 49.57 | 245 |
| 49.59 | 269 |
| 49.61 | 237 |
| 49.63 | 265 |
| 49.65 | 269 |
| 49.67 | 255 |
| 49.69 | 263 |
| 49.71 | 240 |
| 49.73 | 238 |
| 49.75 | 260 |
| 49.77 | 245 |
| 49.79 | 254 |
| 49.81 | 254 |
| 49.83 | 279 |
| 49.85 | 239 |
| 49.87 | 270 |
| 49.89 | 252 |
| 49.91 | 288 |
| 49.93 | 284 |
| 49.95 | 276 |
| 49.97 | 291 |
| 49.99 | 248 |
| 50.01 | 286 |
| 50.03 | 290 |
| 50.05 | 259 |
| 50.07 | 248 |
| 50.09 | 275 |
| 50.11 | 267 |
| 50.13 | 258 |
| 50.15 | 264 |
| 50.17 | 287 |
| 50.19 | 299 |
| 50.21 | 276 |
| 50.23 | 280 |
| 50.25 | 296 |
| 50.27 | 268 |
| 50.29 | 287 |
| 50.31 | 277 |
| 50.33 | 283 |
| 50.35 | 252 |
| 50.37 | 251 |
| 50.39 | 273 |
| 50.41 | 268 |
| 50.43 | 237 |
| 50.45 | 269 |
| 50.47 | 224 |
| 50.49 | 265 |
| 50.51 | 279 |
| 50.53 | 268 |
| 50.55 | 270 |
| 50.57 | 262 |
| 50.59 | 239 |
| 50.61 | 267 |
| 50.63 | 291 |
| 50.65 | 239 |
| 50.67 | 239 |
| 50.69 | 246 |
| 50.71 | 254 |
| 50.73 | 278 |
| 50.75 | 257 |
| 50.77 | 266 |
| 50.79 | 258 |
| 50.81 | 247 |
| 50.83 | 274 |
| 50.85 | 281 |
| 50.87 | 271 |
| 50.89 | 260 |
| 50.91 | 262 |
| 50.93 | 256 |
| 50.95 | 266 |
| 50.97 | 284 |
| 50.99 | 227 |
| 51.01 | 284 |
| 51.03 | 258 |
| 51.05 | 276 |
| 51.07 | 260 |
| 51.09 | 251 |
| 51.11 | 268 |
| 51.13 | 281 |
| 51.15 | 253 |
| 51.17 | 247 |
| 51.19 | 278 |
| 51.21 | 265 |
| 51.23 | 277 |
| 51.25 | 282 |
| 51.27 | 277 |
| 51.29 | 293 |
| 51.31 | 277 |
| 51.33 | 272 |
| 51.35 | 257 |
| 51.37 | 253 |
| 51.39 | 254 |
| 51.41 | 270 |
| 51.43 | 285 |
| 51.45 | 265 |
| 51.47 | 257 |
| 51.49 | 295 |
| 51.51 | 250 |
| 51.53 | 269 |
| 51.55 | 282 |
| 51.57 | 256 |
| 51.59 | 259 |
| 51.61 | 302 |
| 51.63 | 302 |
| 51.65 | 314 |
| 51.67 | 309 |
| 51.69 | 334 |
| 51.71 | 368 |
| 51.73 | 375 |
| 51.75 | 409 |
| 51.77 | 411 |
| 51.79 | 370 |
| 51.81 | 380 |
| 51.83 | 377 |
| 51.85 | 400 |
| 51.87 | 383 |
| 51.89 | 339 |
| 51.91 | 356 |
| 51.93 | 318 |
| 51.95 | 361 |
| 51.97 | 309 |
| 51.99 | 325 |
| 52.01 | 346 |
| 52.03 | 297 |
| 52.05 | 352 |
| 52.07 | 338 |
| 52.09 | 362 |
| 52.11 | 317 |
| 52.13 | 345 |
| 52.15 | 358 |
| 52.17 | 378 |
| 52.19 | 371 |
| 52.21 | 382 |
| 52.23 | 401 |
| 52.25 | 371 |
| 52.27 | 394 |
| 52.29 | 440 |
| 52.31 | 435 |
| 52.33 | 443 |
| 52.35 | 422 |
| 52.37 | 472 |
| 52.39 | 494 |
| 52.41 | 530 |
| 52.43 | 521 |
| 52.45 | 485 |
| 52.47 | 504 |
| 52.49 | 542 |
| 52.51 | 540 |
| 52.53 | 588 |
| 52.55 | 614 |
| 52.57 | 619 |
| 52.59 | 684 |
| 52.61 | 682 |
| 52.63 | 699 |
| 52.65 | 771 |
| 52.67 | 803 |
| 52.69 | 809 |
| 52.71 | 873 |
| 52.73 | 869 |
| 52.75 | 964 |
| 52.77 | 884 |
| 52.79 | 1035 |
| 52.81 | 1027 |
| 52.83 | 1054 |
| 52.85 | 1086 |
| 52.87 | 1089 |
| 52.89 | 1113 |
| 52.91 | 1169 |
| 52.93 | 1190 |
| 52.95 | 1232 |
| 52.97 | 1234 |
| 52.99 | 1251 |
| 53.01 | 1175 |
| 53.03 | 1192 |
| 53.05 | 1137 |
| 53.07 | 1061 |
| 53.09 | 1032 |
| 53.11 | 953 |
| 53.13 | 893 |
| 53.15 | 896 |
| 53.17 | 782 |
| 53.19 | 793 |
| 53.21 | 678 |
| 53.23 | 677 |
| 53.25 | 597 |
| 53.27 | 536 |
| 53.29 | 508 |
| 53.31 | 482 |
| 53.33 | 444 |
| 53.35 | 425 |
| 53.37 | 405 |
| 53.39 | 394 |
| 53.41 | 378 |
| 53.43 | 381 |
| 53.45 | 339 |
| 53.47 | 328 |
| 53.49 | 323 |
| 53.51 | 345 |
| 53.53 | 296 |
| 53.55 | 295 |
| 53.57 | 285 |
| 53.59 | 287 |
| 53.61 | 278 |
| 53.63 | 264 |
| 53.65 | 252 |
| 53.67 | 242 |
| 53.69 | 271 |
| 53.71 | 275 |
| 53.73 | 282 |
| 53.75 | 236 |
| 53.77 | 233 |
| 53.79 | 255 |
| 53.81 | 247 |
| 53.83 | 227 |
| 53.85 | 221 |
| 53.87 | 236 |
| 53.89 | 223 |
| 53.91 | 265 |
| 53.93 | 239 |
| 53.95 | 219 |
| 53.97 | 224 |
| 53.99 | 213 |
| 54.01 | 231 |
| 54.03 | 247 |
| 54.05 | 214 |
| 54.07 | 230 |
| 54.09 | 199 |
| 54.11 | 219 |
| 54.13 | 200 |
| 54.15 | 215 |
| 54.17 | 228 |
| 54.19 | 228 |
| 54.21 | 216 |
| 54.23 | 190 |
| 54.25 | 188 |
| 54.27 | 192 |
| 54.29 | 195 |
| 54.31 | 211 |
| 54.33 | 195 |
| 54.35 | 205 |
| 54.37 | 184 |
| 54.39 | 215 |
| 54.41 | 176 |
| 54.43 | 234 |
| 54.45 | 194 |
| 54.47 | 176 |
| 54.49 | 195 |
| 54.51 | 176 |
| 54.53 | 211 |
| 54.55 | 204 |
| 54.57 | 219 |
| 54.59 | 199 |
| 54.61 | 206 |
| 54.63 | 199 |
| 54.65 | 215 |
| 54.67 | 185 |
| 54.69 | 192 |
| 54.71 | 196 |
| 54.73 | 199 |
| 54.75 | 209 |
| 54.77 | 186 |
| 54.79 | 168 |
| 54.81 | 203 |
| 54.83 | 211 |
| 54.85 | 198 |
| 54.87 | 203 |
| 54.89 | 202 |
| 54.91 | 198 |
| 54.93 | 178 |
| 54.95 | 232 |
| 54.97 | 187 |
| 54.99 | 166 |
| 55.01 | 166 |
| 55.03 | 183 |
| 55.05 | 191 |
| 55.07 | 172 |
| 55.09 | 177 |
| 55.11 | 203 |
| 55.13 | 169 |
| 55.15 | 201 |
| 55.17 | 200 |
| 55.19 | 189 |
| 55.21 | 195 |
| 55.23 | 189 |
| 55.25 | 199 |
| 55.27 | 185 |
| 55.29 | 189 |
| 55.31 | 166 |
| 55.33 | 183 |
| 55.35 | 187 |
| 55.37 | 170 |
| 55.39 | 214 |
| 55.41 | 212 |
| 55.43 | 180 |
| 55.45 | 169 |
| 55.47 | 174 |
| 55.49 | 169 |
| 55.51 | 197 |
| 55.53 | 172 |
| 55.55 | 204 |
| 55.57 | 161 |
| 55.59 | 198 |
| 55.61 | 206 |
| 55.63 | 202 |
| 55.65 | 211 |
| 55.67 | 163 |
| 55.69 | 195 |
| 55.71 | 193 |
| 55.73 | 200 |
| 55.75 | 157 |
| 55.77 | 157 |
| 55.79 | 182 |
| 55.81 | 175 |
| 55.83 | 173 |
| 55.85 | 169 |
| 55.87 | 210 |
| 55.89 | 186 |
| 55.91 | 170 |
| 55.93 | 188 |
| 55.95 | 190 |
| 55.97 | 166 |
| 55.99 | 182 |
| 56.01 | 201 |
| 56.03 | 205 |
| 56.05 | 206 |
| 56.07 | 192 |
| 56.09 | 214 |
| 56.11 | 162 |
| 56.13 | 202 |
| 56.15 | 188 |
| 56.17 | 196 |
| 56.19 | 197 |
| 56.21 | 181 |
| 56.23 | 187 |
| 56.25 | 197 |
| 56.27 | 207 |
| 56.29 | 178 |
| 56.31 | 206 |
| 56.33 | 165 |
| 56.35 | 208 |
| 56.37 | 218 |
| 56.39 | 199 |
| 56.41 | 224 |
| 56.43 | 187 |
| 56.45 | 198 |
| 56.47 | 196 |
| 56.49 | 211 |
| 56.51 | 224 |
| 56.53 | 232 |
| 56.55 | 250 |
| 56.57 | 266 |
| 56.59 | 321 |
| 56.61 | 429 |
| 56.63 | 459 |
| 56.65 | 423 |
| 56.67 | 449 |
| 56.69 | 415 |
| 56.71 | 400 |
| 56.73 | 337 |
| 56.75 | 330 |
| 56.77 | 308 |
| 56.79 | 305 |
| 56.81 | 322 |
| 56.83 | 313 |
| 56.85 | 263 |
| 56.87 | 252 |
| 56.89 | 237 |
| 56.91 | 228 |
| 56.93 | 200 |
| 56.95 | 208 |
| 56.97 | 235 |
| 56.99 | 217 |
| 57.01 | 215 |
| 57.03 | 216 |
| 57.05 | 206 |
| 57.07 | 208 |
| 57.09 | 219 |
| 57.11 | 200 |
| 57.13 | 217 |
| 57.15 | 211 |
| 57.17 | 202 |
| 57.19 | 214 |
| 57.21 | 234 |
| 57.23 | 196 |
| 57.25 | 222 |
| 57.27 | 232 |
| 57.29 | 201 |
| 57.31 | 214 |
| 57.33 | 214 |
| 57.35 | 215 |
| 57.37 | 232 |
| 57.39 | 204 |
| 57.41 | 193 |
| 57.43 | 226 |
| 57.45 | 187 |
| 57.47 | 226 |
| 57.49 | 201 |
| 57.51 | 199 |
| 57.53 | 210 |
| 57.55 | 178 |
| 57.57 | 211 |
| 57.59 | 203 |
| 57.61 | 214 |
| 57.63 | 216 |
| 57.65 | 203 |
| 57.67 | 242 |
| 57.69 | 234 |
| 57.71 | 237 |
| 57.73 | 228 |
| 57.75 | 212 |
| 57.77 | 232 |
| 57.79 | 237 |
| 57.81 | 218 |
| 57.83 | 196 |
| 57.85 | 205 |
| 57.87 | 230 |
| 57.89 | 225 |
| 57.91 | 237 |
| 57.93 | 212 |
| 57.95 | 228 |
| 57.97 | 196 |
| 57.99 | 222 |
| 58.01 | 207 |
| 58.03 | 209 |
| 58.05 | 239 |
| 58.07 | 223 |
| 58.09 | 225 |
| 58.11 | 221 |
| 58.13 | 241 |
| 58.15 | 248 |
| 58.17 | 219 |
| 58.19 | 230 |
| 58.21 | 245 |
| 58.23 | 271 |
| 58.25 | 240 |
| 58.27 | 261 |
| 58.29 | 252 |
| 58.31 | 248 |
| 58.33 | 227 |
| 58.35 | 256 |
| 58.37 | 232 |
| 58.39 | 245 |
| 58.41 | 274 |
| 58.43 | 264 |
| 58.45 | 261 |
| 58.47 | 270 |
| 58.49 | 270 |
| 58.51 | 284 |
| 58.53 | 253 |
| 58.55 | 248 |
| 58.57 | 277 |
| 58.59 | 288 |
| 58.61 | 279 |
| 58.63 | 275 |
| 58.65 | 266 |
| 58.67 | 263 |
| 58.69 | 275 |
| 58.71 | 279 |
| 58.73 | 263 |
| 58.75 | 278 |
| 58.77 | 282 |
| 58.79 | 285 |
| 58.81 | 282 |
| 58.83 | 262 |
| 58.85 | 292 |
| 58.87 | 274 |
| 58.89 | 289 |
| 58.91 | 269 |
| 58.93 | 300 |
| 58.95 | 286 |
| 58.97 | 260 |
| 58.99 | 285 |
| 59.01 | 253 |
| 59.03 | 302 |
| 59.05 | 275 |
| 59.07 | 270 |
| 59.09 | 269 |
| 59.11 | 263 |
| 59.13 | 254 |
| 59.15 | 257 |
| 59.17 | 283 |
| 59.19 | 278 |
| 59.21 | 252 |
| 59.23 | 273 |
| 59.25 | 283 |
| 59.27 | 282 |
| 59.29 | 263 |
| 59.31 | 271 |
| 59.33 | 255 |
| 59.35 | 235 |
| 59.37 | 244 |
| 59.39 | 275 |
| 59.41 | 243 |
| 59.43 | 249 |
| 59.45 | 257 |
| 59.47 | 256 |
| 59.49 | 232 |
| 59.51 | 229 |
| 59.53 | 250 |
| 59.55 | 244 |
| 59.57 | 241 |
| 59.59 | 223 |
| 59.61 | 237 |
| 59.63 | 233 |
| 59.65 | 232 |
| 59.67 | 240 |
| 59.69 | 227 |
| 59.71 | 216 |
| 59.73 | 219 |
| 59.75 | 211 |
| 59.77 | 219 |
| 59.79 | 224 |
| 59.81 | 209 |
| 59.83 | 227 |
| 59.85 | 198 |
| 59.87 | 199 |
| 59.89 | 213 |
| 59.91 | 173 |
| 59.93 | 234 |
| 59.95 | 208 |
| 59.97 | 195 |
| 59.99 | 187 |
| 60.01 | 198 |
| 60.03 | 186 |
| 60.05 | 192 |
| 60.07 | 187 |
| 60.09 | 171 |
| 60.11 | 205 |
| 60.13 | 190 |
| 60.15 | 193 |
| 60.17 | 213 |
| 60.19 | 199 |
| 60.21 | 215 |
| 60.23 | 169 |
| 60.25 | 208 |
| 60.27 | 221 |
| 60.29 | 202 |
| 60.31 | 195 |
| 60.33 | 204 |
| 60.35 | 219 |
| 60.37 | 188 |
| 60.39 | 216 |
| 60.41 | 192 |
| 60.43 | 181 |
| 60.45 | 215 |
| 60.47 | 187 |
| 60.49 | 200 |
| 60.51 | 199 |
| 60.53 | 177 |
| 60.55 | 209 |
| 60.57 | 158 |
| 60.59 | 170 |
| 60.61 | 172 |
| 60.63 | 171 |
| 60.65 | 176 |
| 60.67 | 162 |
| 60.69 | 155 |
| 60.71 | 176 |
| 60.73 | 169 |
| 60.75 | 144 |
| 60.77 | 176 |
| 60.79 | 175 |
| 60.81 | 138 |
| 60.83 | 149 |
| 60.85 | 148 |
| 60.87 | 163 |
| 60.89 | 160 |
| 60.91 | 170 |
| 60.93 | 134 |
| 60.95 | 153 |
| 60.97 | 166 |
| 60.99 | 137 |
| 61.01 | 148 |
| 61.03 | 145 |
| 61.05 | 153 |
| 61.07 | 148 |
| 61.09 | 172 |
| 61.11 | 147 |
| 61.13 | 134 |
| 61.15 | 137 |
| 61.17 | 145 |
| 61.19 | 141 |
| 61.21 | 153 |
| 61.23 | 138 |
| 61.25 | 138 |
| 61.27 | 145 |
| 61.29 | 157 |
| 61.31 | 143 |
| 61.33 | 128 |
| 61.35 | 166 |
| 61.37 | 138 |
| 61.39 | 151 |
| 61.41 | 148 |
| 61.43 | 144 |
| 61.45 | 141 |
| 61.47 | 149 |
| 61.49 | 147 |
| 61.51 | 137 |
| 61.53 | 140 |
| 61.55 | 133 |
| 61.57 | 140 |
| 61.59 | 139 |
| 61.61 | 144 |
| 61.63 | 147 |
| 61.65 | 137 |
| 61.67 | 143 |
| 61.69 | 128 |
| 61.71 | 140 |
| 61.73 | 155 |
| 61.75 | 137 |
| 61.77 | 133 |
| 61.79 | 117 |
| 61.81 | 127 |
| 61.83 | 126 |
| 61.85 | 152 |
| 61.87 | 131 |
| 61.89 | 138 |
| 61.91 | 117 |
| 61.93 | 135 |
| 61.95 | 145 |
| 61.97 | 130 |
| 61.99 | 130 |
| 62.01 | 125 |
| 62.03 | 121 |
| 62.05 | 127 |
| 62.07 | 113 |
| 62.09 | 139 |
| 62.11 | 121 |
| 62.13 | 120 |
| 62.15 | 128 |
| 62.17 | 105 |
| 62.19 | 128 |
| 62.21 | 116 |
| 62.23 | 119 |
| 62.25 | 123 |
| 62.27 | 117 |
| 62.29 | 119 |
| 62.31 | 164 |
| 62.33 | 140 |
| 62.35 | 125 |
| 62.37 | 102 |
| 62.39 | 129 |
| 62.41 | 121 |
| 62.43 | 125 |
| 62.45 | 130 |
| 62.47 | 117 |
| 62.49 | 148 |
| 62.51 | 125 |
| 62.53 | 123 |
| 62.55 | 136 |
| 62.57 | 117 |
| 62.59 | 112 |
| 62.61 | 128 |
| 62.63 | 120 |
| 62.65 | 111 |
| 62.67 | 97 |
| 62.69 | 124 |
| 62.71 | 125 |
| 62.73 | 123 |
| 62.75 | 120 |
| 62.77 | 139 |
| 62.79 | 115 |
| 62.81 | 121 |
| 62.83 | 108 |
| 62.85 | 116 |
| 62.87 | 110 |
| 62.89 | 117 |
| 62.91 | 103 |
| 62.93 | 107 |
| 62.95 | 114 |
| 62.97 | 128 |
| 62.99 | 119 |
| 63.01 | 115 |
| 63.03 | 123 |
| 63.05 | 101 |
| 63.07 | 120 |
| 63.09 | 103 |
| 63.11 | 131 |
| 63.13 | 140 |
| 63.15 | 101 |
| 63.17 | 106 |
| 63.19 | 116 |
| 63.21 | 125 |
| 63.23 | 108 |
| 63.25 | 115 |
| 63.27 | 127 |
| 63.29 | 116 |
| 63.31 | 110 |
| 63.33 | 111 |
| 63.35 | 102 |
| 63.37 | 120 |
| 63.39 | 109 |
| 63.41 | 115 |
| 63.43 | 122 |
| 63.45 | 99 |
| 63.47 | 111 |
| 63.49 | 106 |
| 63.51 | 110 |
| 63.53 | 101 |
| 63.55 | 117 |
| 63.57 | 101 |
| 63.59 | 139 |
| 63.61 | 120 |
| 63.63 | 124 |
| 63.65 | 106 |
| 63.67 | 105 |
| 63.69 | 105 |
| 63.71 | 112 |
| 63.73 | 96 |
| 63.75 | 100 |
| 63.77 | 121 |
| 63.79 | 114 |
| 63.81 | 116 |
| 63.83 | 105 |
| 63.85 | 119 |
| 63.87 | 108 |
| 63.89 | 112 |
| 63.91 | 126 |
| 63.93 | 112 |
| 63.95 | 104 |
| 63.97 | 105 |
| 63.99 | 99 |
| 64.01 | 110 |
| 64.03 | 112 |
| 64.05 | 105 |
| 64.07 | 107 |
| 64.09 | 112 |
| 64.11 | 99 |
| 64.13 | 109 |
| 64.15 | 108 |
| 64.17 | 104 |
| 64.19 | 104 |
| 64.21 | 103 |
| 64.23 | 111 |
| 64.25 | 110 |
| 64.27 | 113 |
| 64.29 | 83 |
| 64.31 | 93 |
| 64.33 | 95 |
| 64.35 | 116 |
| 64.37 | 87 |
| 64.39 | 97 |
| 64.41 | 98 |
| 64.43 | 121 |
| 64.45 | 103 |
| 64.47 | 84 |
| 64.49 | 89 |
| 64.51 | 87 |
| 64.53 | 105 |
| 64.55 | 96 |
| 64.57 | 94 |
| 64.59 | 109 |
| 64.61 | 99 |
| 64.63 | 94 |
| 64.65 | 85 |
| 64.67 | 107 |
| 64.69 | 94 |
| 64.71 | 112 |
| 64.73 | 106 |
| 64.75 | 95 |
| 64.77 | 107 |
| 64.79 | 106 |
| 64.81 | 93 |
| 64.83 | 109 |
| 64.85 | 113 |
| 64.87 | 97 |
| 64.89 | 90 |
| 64.91 | 122 |
| 64.93 | 85 |
| 64.95 | 94 |
| 64.97 | 116 |
| 64.99 | 99 |
| 65.01 | 100 |
| 65.03 | 96 |
| 65.05 | 92 |
| 65.07 | 117 |
| 65.09 | 98 |
| 65.11 | 110 |
| 65.13 | 88 |
| 65.15 | 115 |
| 65.17 | 96 |
| 65.19 | 111 |
| 65.21 | 84 |
| 65.23 | 95 |
| 65.25 | 88 |
| 65.27 | 110 |
| 65.29 | 128 |
| 65.31 | 100 |
| 65.33 | 122 |
| 65.35 | 87 |
| 65.37 | 100 |
| 65.39 | 106 |
| 65.41 | 115 |
| 65.43 | 102 |
| 65.45 | 118 |
| 65.47 | 110 |
| 65.49 | 130 |
| 65.51 | 119 |
| 65.53 | 146 |
| 65.55 | 159 |
| 65.57 | 189 |
| 65.59 | 214 |
| 65.61 | 224 |
| 65.63 | 224 |
| 65.65 | 227 |
| 65.67 | 206 |
| 65.69 | 155 |
| 65.71 | 149 |
| 65.73 | 168 |
| 65.75 | 158 |
| 65.77 | 147 |
| 65.79 | 176 |
| 65.81 | 158 |
| 65.83 | 145 |
| 65.85 | 109 |
| 65.87 | 123 |
| 65.89 | 143 |
| 65.91 | 132 |
| 65.93 | 98 |
| 65.95 | 116 |
| 65.97 | 97 |
| 65.99 | 118 |
| 66.01 | 107 |
| 66.03 | 119 |
| 66.05 | 100 |
| 66.07 | 92 |
| 66.09 | 103 |
| 66.11 | 105 |
| 66.13 | 96 |
| 66.15 | 98 |
| 66.17 | 106 |
| 66.19 | 118 |
| 66.21 | 94 |
| 66.23 | 97 |
| 66.25 | 84 |
| 66.27 | 101 |
| 66.29 | 94 |
| 66.31 | 97 |
| 66.33 | 124 |
| 66.35 | 107 |
| 66.37 | 82 |
| 66.39 | 106 |
| 66.41 | 111 |
| 66.43 | 104 |
| 66.45 | 84 |
| 66.47 | 109 |
| 66.49 | 90 |
| 66.51 | 94 |
| 66.53 | 97 |
| 66.55 | 101 |
| 66.57 | 92 |
| 66.59 | 100 |
| 66.61 | 92 |
| 66.63 | 109 |
| 66.65 | 104 |
| 66.67 | 96 |
| 66.69 | 108 |
| 66.71 | 115 |
| 66.73 | 89 |
| 66.75 | 108 |
| 66.77 | 104 |
| 66.79 | 110 |
| 66.81 | 95 |
| 66.83 | 97 |
| 66.85 | 94 |
| 66.87 | 92 |
| 66.89 | 111 |
| 66.91 | 94 |
| 66.93 | 101 |
| 66.95 | 101 |
| 66.97 | 87 |
| 66.99 | 104 |
| 67.01 | 96 |
| 67.03 | 99 |
| 67.05 | 111 |
| 67.07 | 105 |
| 67.09 | 91 |
| 67.11 | 103 |
| 67.13 | 120 |
| 67.15 | 115 |
| 67.17 | 128 |
| 67.19 | 154 |
| 67.21 | 115 |
| 67.23 | 145 |
| 67.25 | 230 |
| 67.27 | 247 |
| 67.29 | 299 |
| 67.31 | 310 |
| 67.33 | 317 |
| 67.35 | 269 |
| 67.37 | 243 |
| 67.39 | 196 |
| 67.41 | 187 |
| 67.43 | 190 |
| 67.45 | 167 |
| 67.47 | 182 |
| 67.49 | 196 |
| 67.51 | 211 |
| 67.53 | 191 |
| 67.55 | 176 |
| 67.57 | 141 |
| 67.59 | 131 |
| 67.61 | 111 |
| 67.63 | 121 |
| 67.65 | 130 |
| 67.67 | 98 |
| 67.69 | 106 |
| 67.71 | 101 |
| 67.73 | 113 |
| 67.75 | 99 |
| 67.77 | 110 |
| 67.79 | 106 |
| 67.81 | 90 |
| 67.83 | 97 |
| 67.85 | 120 |
| 67.87 | 93 |
| 67.89 | 91 |
| 67.91 | 100 |
| 67.93 | 100 |
| 67.95 | 93 |
| 67.97 | 103 |
| 67.99 | 87 |
| 68.01 | 99 |
| 68.03 | 90 |
| 68.05 | 103 |
| 68.07 | 106 |
| 68.09 | 92 |
| 68.11 | 93 |
| 68.13 | 102 |
| 68.15 | 103 |
| 68.17 | 106 |
| 68.19 | 94 |
| 68.21 | 113 |
| 68.23 | 105 |
| 68.25 | 90 |
| 68.27 | 105 |
| 68.29 | 96 |
| 68.31 | 73 |
| 68.33 | 123 |
| 68.35 | 95 |
| 68.37 | 99 |
| 68.39 | 104 |
| 68.41 | 98 |
| 68.43 | 91 |
| 68.45 | 101 |
| 68.47 | 97 |
| 68.49 | 101 |
| 68.51 | 90 |
| 68.53 | 101 |
| 68.55 | 97 |
| 68.57 | 88 |
| 68.59 | 85 |
| 68.61 | 93 |
| 68.63 | 103 |
| 68.65 | 93 |
| 68.67 | 94 |
| 68.69 | 106 |
| 68.71 | 95 |
| 68.73 | 99 |
| 68.75 | 104 |
| 68.77 | 104 |
| 68.79 | 91 |
| 68.81 | 102 |
| 68.83 | 109 |
| 68.85 | 94 |
| 68.87 | 96 |
| 68.89 | 107 |
| 68.91 | 105 |
| 68.93 | 89 |
| 68.95 | 99 |
| 68.97 | 89 |
| 68.99 | 99 |
| 69.01 | 84 |
| 69.03 | 92 |
| 69.05 | 87 |
| 69.07 | 102 |
| 69.09 | 95 |
| 69.11 | 95 |
| 69.13 | 97 |
| 69.15 | 92 |
| 69.17 | 100 |
| 69.19 | 86 |
| 69.21 | 101 |
| 69.23 | 104 |
| 69.25 | 81 |
| 69.27 | 96 |
| 69.29 | 98 |
| 69.31 | 99 |
| 69.33 | 72 |
| 69.35 | 95 |
| 69.37 | 94 |
| 69.39 | 110 |
| 69.41 | 97 |
| 69.43 | 82 |
| 69.45 | 80 |
| 69.47 | 94 |
| 69.49 | 105 |
| 69.51 | 98 |
| 69.53 | 92 |
| 69.55 | 94 |
| 69.57 | 96 |
| 69.59 | 92 |
| 69.61 | 90 |
| 69.63 | 99 |
| 69.65 | 102 |
| 69.67 | 105 |
| 69.69 | 106 |
| 69.71 | 103 |
| 69.73 | 88 |
| 69.75 | 104 |
| 69.77 | 93 |
| 69.79 | 105 |
| 69.81 | 96 |
| 69.83 | 88 |
| 69.85 | 83 |
| 69.87 | 82 |
| 69.89 | 119 |
| 69.91 | 79 |
| 69.93 | 65 |
| 69.95 | 103 |
| 69.97 | 99 |
| 69.99 | 100 |
| 70.01 | 95 |
| 70.03 | 90 |
| 70.05 | 100 |
| 70.07 | 106 |
| 70.09 | 107 |
| 70.11 | 90 |
| 70.13 | 91 |
| 70.15 | 112 |
| 70.17 | 85 |
| 70.19 | 90 |
| 70.21 | 86 |
| 70.23 | 97 |
| 70.25 | 99 |
| 70.27 | 86 |
| 70.29 | 95 |
| 70.31 | 85 |
| 70.33 | 102 |
| 70.35 | 88 |
| 70.37 | 96 |
| 70.39 | 100 |
| 70.41 | 81 |
| 70.43 | 97 |
| 70.45 | 94 |
| 70.47 | 87 |
| 70.49 | 95 |
| 70.51 | 89 |
| 70.53 | 88 |
| 70.55 | 89 |
| 70.57 | 99 |
| 70.59 | 82 |
| 70.61 | 89 |
| 70.63 | 106 |
| 70.65 | 81 |
| 70.67 | 78 |
| 70.69 | 89 |
| 70.71 | 87 |
| 70.73 | 86 |
| 70.75 | 104 |
| 70.77 | 93 |
| 70.79 | 99 |
| 70.81 | 74 |
| 70.83 | 108 |
| 70.85 | 106 |
| 70.87 | 94 |
| 70.89 | 104 |
| 70.91 | 101 |
| 70.93 | 98 |
| 70.95 | 82 |
| 70.97 | 75 |
| 70.99 | 88 |
| 71.01 | 83 |
| 71.03 | 99 |
| 71.05 | 77 |
| 71.07 | 82 |
| 71.09 | 95 |
| 71.11 | 75 |
| 71.13 | 95 |
| 71.15 | 95 |
| 71.17 | 85 |
| 71.19 | 116 |
| 71.21 | 82 |
| 71.23 | 101 |
| 71.25 | 81 |
| 71.27 | 92 |
| 71.29 | 79 |
| 71.31 | 94 |
| 71.33 | 91 |
| 71.35 | 96 |
| 71.37 | 96 |
| 71.39 | 81 |
| 71.41 | 73 |
| 71.43 | 100 |
| 71.45 | 88 |
| 71.47 | 98 |
| 71.49 | 89 |
| 71.51 | 97 |
| 71.53 | 93 |
| 71.55 | 92 |
| 71.57 | 83 |
| 71.59 | 71 |
| 71.61 | 85 |
| 71.63 | 85 |
| 71.65 | 74 |
| 71.67 | 101 |
| 71.69 | 74 |
| 71.71 | 79 |
| 71.73 | 88 |
| 71.75 | 84 |
| 71.77 | 83 |
| 71.79 | 83 |
| 71.81 | 97 |
| 71.83 | 99 |
| 71.85 | 96 |
| 71.87 | 75 |
| 71.89 | 87 |
| 71.91 | 96 |
| 71.93 | 77 |
| 71.95 | 89 |
| 71.97 | 98 |
| 71.99 | 68 |
| 72.01 | 79 |
| 72.03 | 73 |
| 72.05 | 87 |
| 72.07 | 100 |
| 72.09 | 71 |
| 72.11 | 91 |
| 72.13 | 93 |
| 72.15 | 98 |
| 72.17 | 102 |
| 72.19 | 73 |
| 72.21 | 85 |
| 72.23 | 100 |
| 72.25 | 101 |
| 72.27 | 93 |
| 72.29 | 81 |
| 72.31 | 84 |
| 72.33 | 108 |
| 72.35 | 86 |
| 72.37 | 101 |
| 72.39 | 82 |
| 72.41 | 106 |
| 72.43 | 84 |
| 72.45 | 78 |
| 72.47 | 75 |
| 72.49 | 73 |
| 72.51 | 93 |
| 72.53 | 79 |
| 72.55 | 92 |
| 72.57 | 77 |
| 72.59 | 81 |
| 72.61 | 80 |
| 72.63 | 89 |
| 72.65 | 88 |
| 72.67 | 95 |
| 72.69 | 84 |
| 72.71 | 87 |
| 72.73 | 78 |
| 72.75 | 92 |
| 72.77 | 111 |
| 72.79 | 91 |
| 72.81 | 83 |
| 72.83 | 83 |
| 72.85 | 95 |
| 72.87 | 81 |
| 72.89 | 101 |
| 72.91 | 87 |
| 72.93 | 80 |
| 72.95 | 81 |
| 72.97 | 84 |
| 72.99 | 90 |
| 73.01 | 83 |
| 73.03 | 85 |
| 73.05 | 102 |
| 73.07 | 91 |
| 73.09 | 83 |
| 73.11 | 104 |
| 73.13 | 117 |
| 73.15 | 96 |
| 73.17 | 91 |
| 73.19 | 76 |
| 73.21 | 86 |
| 73.23 | 103 |
| 73.25 | 91 |
| 73.27 | 75 |
| 73.29 | 88 |
| 73.31 | 100 |
| 73.33 | 102 |
| 73.35 | 97 |
| 73.37 | 92 |
| 73.39 | 76 |
| 73.41 | 90 |
| 73.43 | 92 |
| 73.45 | 101 |
| 73.47 | 98 |
| 73.49 | 89 |
| 73.51 | 113 |
| 73.53 | 72 |
| 73.55 | 76 |
| 73.57 | 85 |
| 73.59 | 97 |
| 73.61 | 97 |
| 73.63 | 101 |
| 73.65 | 110 |
| 73.67 | 105 |
| 73.69 | 110 |
| 73.71 | 88 |
| 73.73 | 96 |
| 73.75 | 101 |
| 73.77 | 88 |
| 73.79 | 90 |
| 73.81 | 97 |
| 73.83 | 86 |
| 73.85 | 85 |
| 73.87 | 66 |
| 73.89 | 91 |
| 73.91 | 87 |
| 73.93 | 73 |
| 73.95 | 95 |
| 73.97 | 91 |
| 73.99 | 85 |
| 74.01 | 79 |
| 74.03 | 94 |
| 74.05 | 92 |
| 74.07 | 91 |
| 74.09 | 98 |
| 74.11 | 73 |
| 74.13 | 87 |
| 74.15 | 88 |
| 74.17 | 84 |
| 74.19 | 88 |
| 74.21 | 79 |
| 74.23 | 86 |
| 74.25 | 76 |
| 74.27 | 79 |
| 74.29 | 75 |
| 74.31 | 92 |
| 74.33 | 81 |
| 74.35 | 86 |
| 74.37 | 79 |
| 74.39 | 84 |
| 74.41 | 93 |
| 74.43 | 89 |
| 74.45 | 90 |
| 74.47 | 91 |
| 74.49 | 84 |
| 74.51 | 87 |
| 74.53 | 80 |
| 74.55 | 90 |
| 74.57 | 106 |
| 74.59 | 89 |
| 74.61 | 80 |
| 74.63 | 96 |
| 74.65 | 100 |
| 74.67 | 91 |
| 74.69 | 100 |
| 74.71 | 77 |
| 74.73 | 111 |
| 74.75 | 93 |
| 74.77 | 81 |
| 74.79 | 100 |
| 74.81 | 93 |
| 74.83 | 93 |
| 74.85 | 87 |
| 74.87 | 75 |
| 74.89 | 103 |
| 74.91 | 102 |
| 74.93 | 83 |
| 74.95 | 93 |
| 74.97 | 81 |
| 74.99 | 84 |
| 75.01 | 89 |
| 75.03 | 88 |
| 75.05 | 89 |
| 75.07 | 78 |
| 75.09 | 82 |
| 75.11 | 82 |
| 75.13 | 98 |
| 75.15 | 102 |
| 75.17 | 110 |
| 75.19 | 92 |
| 75.21 | 85 |
| 75.23 | 91 |
| 75.25 | 83 |
| 75.27 | 113 |
| 75.29 | 89 |
| 75.31 | 103 |
| 75.33 | 89 |
| 75.35 | 102 |
| 75.37 | 92 |
| 75.39 | 95 |
| 75.41 | 108 |
| 75.43 | 89 |
| 75.45 | 114 |
| 75.47 | 97 |
| 75.49 | 89 |
| 75.51 | 91 |
| 75.53 | 87 |
| 75.55 | 107 |
| 75.57 | 99 |
| 75.59 | 93 |
| 75.61 | 96 |
| 75.63 | 84 |
| 75.65 | 105 |
| 75.67 | 130 |
| 75.69 | 95 |
| 75.71 | 120 |
| 75.73 | 114 |
| 75.75 | 127 |
| 75.77 | 103 |
| 75.79 | 145 |
| 75.81 | 143 |
| 75.83 | 169 |
| 75.85 | 160 |
| 75.87 | 143 |
| 75.89 | 149 |
| 75.91 | 124 |
| 75.93 | 114 |
| 75.95 | 104 |
| 75.97 | 135 |
| 75.99 | 149 |
| 76.01 | 135 |
| 76.03 | 118 |
| 76.05 | 139 |
| 76.07 | 115 |
| 76.09 | 118 |
| 76.11 | 101 |
| 76.13 | 142 |
| 76.15 | 131 |
| 76.17 | 144 |
| 76.19 | 116 |
| 76.21 | 149 |
| 76.23 | 133 |
| 76.25 | 152 |
| 76.27 | 140 |
| 76.29 | 115 |
| 76.31 | 116 |
| 76.33 | 115 |
| 76.35 | 102 |
| 76.37 | 122 |
| 76.39 | 126 |
| 76.41 | 109 |
| 76.43 | 107 |
| 76.45 | 121 |
| 76.47 | 124 |
| 76.49 | 115 |
| 76.51 | 126 |
| 76.53 | 101 |
| 76.55 | 111 |
| 76.57 | 121 |
| 76.59 | 101 |
| 76.61 | 105 |
| 76.63 | 132 |
| 76.65 | 108 |
| 76.67 | 116 |
| 76.69 | 100 |
| 76.71 | 107 |
| 76.73 | 135 |
| 76.75 | 127 |
| 76.77 | 131 |
| 76.79 | 122 |
| 76.81 | 117 |
| 76.83 | 152 |
| 76.85 | 142 |
| 76.87 | 131 |
| 76.89 | 123 |
| 76.91 | 129 |
| 76.93 | 129 |
| 76.95 | 149 |
| 76.97 | 146 |
| 76.99 | 166 |
| 77.01 | 170 |
| 77.03 | 214 |
| 77.05 | 214 |
| 77.07 | 211 |
| 77.09 | 244 |
| 77.11 | 273 |
| 77.13 | 278 |
| 77.15 | 302 |
| 77.17 | 380 |
| 77.19 | 435 |
| 77.21 | 518 |
| 77.23 | 540 |
| 77.25 | 636 |
| 77.27 | 756 |
| 77.29 | 790 |
| 77.31 | 907 |
| 77.33 | 935 |
| 77.35 | 1042 |
| 77.37 | 1132 |
| 77.39 | 1304 |
| 77.41 | 1268 |
| 77.43 | 1343 |
| 77.45 | 1334 |
| 77.47 | 1314 |
| 77.49 | 1231 |
| 77.51 | 1099 |
| 77.53 | 1016 |
| 77.55 | 1012 |
| 77.57 | 965 |
| 77.59 | 937 |
| 77.61 | 846 |
| 77.63 | 844 |
| 77.65 | 781 |
| 77.67 | 815 |
| 77.69 | 708 |
| 77.71 | 689 |
| 77.73 | 567 |
| 77.75 | 494 |
| 77.77 | 462 |
| 77.79 | 452 |
| 77.81 | 361 |
| 77.83 | 337 |
| 77.85 | 329 |
| 77.87 | 296 |
| 77.89 | 312 |
| 77.91 | 272 |
| 77.93 | 267 |
| 77.95 | 235 |
| 77.97 | 229 |
| 77.99 | 233 |
| 78.01 | 239 |
| 78.03 | 223 |
| 78.05 | 226 |
| 78.07 | 207 |
| 78.09 | 205 |
| 78.11 | 202 |
| 78.13 | 195 |
| 78.15 | 187 |
| 78.17 | 200 |
| 78.19 | 188 |
| 78.21 | 189 |
| 78.23 | 191 |
| 78.25 | 163 |
| 78.27 | 192 |
| 78.29 | 163 |
| 78.31 | 172 |
| 78.33 | 175 |
| 78.35 | 153 |
| 78.37 | 153 |
| 78.39 | 148 |
| 78.41 | 166 |
| 78.43 | 163 |
| 78.45 | 151 |
| 78.47 | 154 |
| 78.49 | 147 |
| 78.51 | 138 |
| 78.53 | 132 |
| 78.55 | 154 |
| 78.57 | 141 |
| 78.59 | 141 |
| 78.61 | 142 |
| 78.63 | 141 |
| 78.65 | 120 |
| 78.67 | 159 |
| 78.69 | 157 |
| 78.71 | 155 |
| 78.73 | 171 |
| 78.75 | 136 |
| 78.77 | 141 |
| 78.79 | 121 |
| 78.81 | 151 |
| 78.83 | 133 |
| 78.85 | 144 |
| 78.87 | 133 |
| 78.89 | 117 |
| 78.91 | 148 |
| 78.93 | 140 |
| 78.95 | 118 |
| 78.97 | 125 |
| 78.99 | 153 |
| 79.01 | 135 |
| 79.03 | 138 |
| 79.05 | 137 |
| 79.07 | 134 |
| 79.09 | 124 |
| 79.11 | 166 |
| 79.13 | 142 |
| 79.15 | 115 |
| 79.17 | 153 |
| 79.19 | 129 |
| 79.21 | 135 |
| 79.23 | 129 |
| 79.25 | 129 |
| 79.27 | 146 |
| 79.29 | 132 |
| 79.31 | 119 |
| 79.33 | 108 |
| 79.35 | 161 |
| 79.37 | 136 |
| 79.39 | 146 |
| 79.41 | 121 |
| 79.43 | 163 |
| 79.45 | 159 |
| 79.47 | 144 |
| 79.49 | 128 |
| 79.51 | 141 |
| 79.53 | 138 |
| 79.55 | 121 |
| 79.57 | 139 |
| 79.59 | 163 |
| 79.61 | 127 |
| 79.63 | 138 |
| 79.65 | 170 |
| 79.67 | 172 |
| 79.69 | 157 |
| 79.71 | 149 |
| 79.73 | 154 |
| 79.75 | 152 |
| 79.77 | 142 |
| 79.79 | 152 |
| 79.81 | 121 |
| 79.83 | 157 |
| 79.85 | 152 |
| 79.87 | 154 |
| 79.89 | 158 |
| 79.91 | 136 |
| 79.93 | 136 |
| 79.95 | 132 |
| 79.97 | 128 |
| 79.99 | 134 |
| 80.01 | 147 |
| 80.03 | 131 |
| 80.05 | 169 |
| 80.07 | 152 |
| 80.09 | 124 |
| 80.11 | 140 |
| 80.13 | 160 |
| 80.15 | 134 |
| 80.17 | 136 |
| 80.19 | 126 |
| 80.21 | 125 |
| 80.23 | 150 |
| 80.25 | 156 |
| 80.27 | 157 |
| 80.29 | 130 |
| 80.31 | 149 |
| 80.33 | 139 |
| 80.35 | 141 |
| 80.37 | 144 |
| 80.39 | 136 |
| 80.41 | 125 |
| 80.43 | 133 |
| 80.45 | 141 |
| 80.47 | 131 |
| 80.49 | 146 |
| 80.51 | 135 |
| 80.53 | 141 |
| 80.55 | 184 |
| 80.57 | 142 |
| 80.59 | 164 |
| 80.61 | 148 |
| 80.63 | 149 |
| 80.65 | 125 |
| 80.67 | 138 |
| 80.69 | 152 |
| 80.71 | 169 |
| 80.73 | 134 |
| 80.75 | 138 |
| 80.77 | 159 |
| 80.79 | 144 |
| 80.81 | 144 |
| 80.83 | 156 |
| 80.85 | 156 |
| 80.87 | 143 |
| 80.89 | 162 |
| 80.91 | 163 |
| 80.93 | 182 |
| 80.95 | 155 |
| 80.97 | 145 |
| 80.99 | 150 |
| 81.01 | 156 |
| 81.03 | 137 |
| 81.05 | 167 |
| 81.07 | 160 |
| 81.09 | 165 |
| 81.11 | 144 |
| 81.13 | 145 |
| 81.15 | 167 |
| 81.17 | 159 |
| 81.19 | 170 |
| 81.21 | 172 |
| 81.23 | 164 |
| 81.25 | 178 |
| 81.27 | 190 |
| 81.29 | 168 |
| 81.31 | 182 |
| 81.33 | 165 |
| 81.35 | 168 |
| 81.37 | 168 |
| 81.39 | 160 |
| 81.41 | 176 |
| 81.43 | 153 |
| 81.45 | 183 |
| 81.47 | 187 |
| 81.49 | 169 |
| 81.51 | 169 |
| 81.53 | 165 |
| 81.55 | 165 |
| 81.57 | 186 |
| 81.59 | 171 |
| 81.61 | 187 |
| 81.63 | 194 |
| 81.65 | 205 |
| 81.67 | 180 |
| 81.69 | 184 |
| 81.71 | 214 |
| 81.73 | 170 |
| 81.75 | 184 |
| 81.77 | 185 |
| 81.79 | 219 |
| 81.81 | 213 |
| 81.83 | 233 |
| 81.85 | 179 |
| 81.87 | 187 |
| 81.89 | 243 |
| 81.91 | 220 |
| 81.93 | 224 |
| 81.95 | 246 |
| 81.97 | 204 |
| 81.99 | 223 |
| 82.01 | 205 |
| 82.03 | 247 |
| 82.05 | 223 |
| 82.07 | 241 |
| 82.09 | 259 |
| 82.11 | 237 |
| 82.13 | 232 |
| 82.15 | 231 |
| 82.17 | 261 |
| 82.19 | 256 |
| 82.21 | 234 |
| 82.23 | 254 |
| 82.25 | 237 |
| 82.27 | 279 |
| 82.29 | 264 |
| 82.31 | 288 |
| 82.33 | 287 |
| 82.35 | 286 |
| 82.37 | 294 |
| 82.39 | 301 |
| 82.41 | 287 |
| 82.43 | 258 |
| 82.45 | 286 |
| 82.47 | 326 |
| 82.49 | 324 |
| 82.51 | 307 |
| 82.53 | 336 |
| 82.55 | 318 |
| 82.57 | 334 |
| 82.59 | 319 |
| 82.61 | 374 |
| 82.63 | 345 |
| 82.65 | 361 |
| 82.67 | 330 |
| 82.69 | 374 |
| 82.71 | 392 |
| 82.73 | 401 |
| 82.75 | 425 |
| 82.77 | 409 |
| 82.79 | 419 |
| 82.81 | 463 |
| 82.83 | 452 |
| 82.85 | 456 |
| 82.87 | 455 |
| 82.89 | 504 |
| 82.91 | 524 |
| 82.93 | 482 |
| 82.95 | 530 |
| 82.97 | 513 |
| 82.99 | 487 |
| 83.01 | 540 |
| 83.03 | 524 |
| 83.05 | 554 |
| 83.07 | 571 |
| 83.09 | 562 |
| 83.11 | 578 |
| 83.13 | 588 |
| 83.15 | 538 |
| 83.17 | 615 |
| 83.19 | 608 |
| 83.21 | 603 |
| 83.23 | 602 |
| 83.25 | 627 |
| 83.27 | 605 |
| 83.29 | 609 |
| 83.31 | 614 |
| 83.33 | 625 |
| 83.35 | 615 |
| 83.37 | 602 |
| 83.39 | 562 |
| 83.41 | 598 |
| 83.43 | 566 |
| 83.45 | 562 |
| 83.47 | 534 |
| 83.49 | 543 |
| 83.51 | 535 |
| 83.53 | 544 |
| 83.55 | 555 |
| 83.57 | 539 |
| 83.59 | 499 |
| 83.61 | 519 |
| 83.63 | 467 |
| 83.65 | 454 |
| 83.67 | 404 |
| 83.69 | 453 |
| 83.71 | 446 |
| 83.73 | 416 |
| 83.75 | 416 |
| 83.77 | 400 |
| 83.79 | 407 |
| 83.81 | 411 |
| 83.83 | 413 |
| 83.85 | 380 |
| 83.87 | 401 |
| 83.89 | 318 |
| 83.91 | 379 |
| 83.93 | 351 |
| 83.95 | 380 |
| 83.97 | 352 |
| 83.99 | 307 |
| 84.01 | 324 |
| 84.03 | 337 |
| 84.05 | 321 |
| 84.07 | 330 |
| 84.09 | 306 |
| 84.11 | 317 |
| 84.13 | 323 |
| 84.15 | 315 |
| 84.17 | 277 |
| 84.19 | 302 |
| 84.21 | 273 |
| 84.23 | 272 |
| 84.25 | 268 |
| 84.27 | 255 |
| 84.29 | 281 |
| 84.31 | 272 |
| 84.33 | 267 |
| 84.35 | 237 |
| 84.37 | 221 |
| 84.39 | 230 |
| 84.41 | 250 |
| 84.43 | 245 |
| 84.45 | 218 |
| 84.47 | 226 |
| 84.49 | 210 |
| 84.51 | 239 |
| 84.53 | 217 |
| 84.55 | 234 |
| 84.57 | 212 |
| 84.59 | 181 |
| 84.61 | 188 |
| 84.63 | 181 |
| 84.65 | 187 |
| 84.67 | 168 |
| 84.69 | 183 |
| 84.71 | 185 |
| 84.73 | 184 |
| 84.75 | 177 |
| 84.77 | 171 |
| 84.79 | 174 |
| 84.81 | 168 |
| 84.83 | 170 |
| 84.85 | 146 |
| 84.87 | 188 |
| 84.89 | 169 |
| 84.91 | 158 |
| 84.93 | 173 |
| 84.95 | 180 |
| 84.97 | 169 |
| 84.99 | 154 |
| 85.01 | 186 |
| 85.03 | 173 |
| 85.05 | 145 |
| 85.07 | 148 |
| 85.09 | 180 |
| 85.11 | 174 |
| 85.13 | 166 |
| 85.15 | 115 |
| 85.17 | 151 |
| 85.19 | 156 |
| 85.21 | 177 |
| 85.23 | 152 |
| 85.25 | 185 |
| 85.27 | 159 |
| 85.29 | 160 |
| 85.31 | 177 |
| 85.33 | 168 |
| 85.35 | 147 |
| 85.37 | 148 |
| 85.39 | 146 |
| 85.41 | 142 |
| 85.43 | 169 |
| 85.45 | 175 |
| 85.47 | 163 |
| 85.49 | 126 |
| 85.51 | 144 |
| 85.53 | 142 |
| 85.55 | 151 |
| 85.57 | 142 |
| 85.59 | 152 |
| 85.61 | 141 |
| 85.63 | 147 |
| 85.65 | 132 |
| 85.67 | 121 |
| 85.69 | 119 |
| 85.71 | 137 |
| 85.73 | 136 |
| 85.75 | 131 |
| 85.77 | 127 |
| 85.79 | 139 |
| 85.81 | 131 |
| 85.83 | 134 |
| 85.85 | 121 |
| 85.87 | 129 |
| 85.89 | 123 |
| 85.91 | 107 |
| 85.93 | 114 |
| 85.95 | 112 |
| 85.97 | 129 |
| 85.99 | 117 |
| 86.01 | 123 |
| 86.03 | 141 |
| 86.05 | 112 |
| 86.07 | 110 |
| 86.09 | 94 |
| 86.11 | 116 |
| 86.13 | 127 |
| 86.15 | 102 |
| 86.17 | 111 |
| 86.19 | 117 |
| 86.21 | 102 |
| 86.23 | 117 |
| 86.25 | 107 |
| 86.27 | 107 |
| 86.29 | 115 |
| 86.31 | 125 |
| 86.33 | 98 |
| 86.35 | 94 |
| 86.37 | 102 |
| 86.39 | 95 |
| 86.41 | 96 |
| 86.43 | 114 |
| 86.45 | 99 |
| 86.47 | 90 |
| 86.49 | 103 |
| 86.51 | 108 |
| 86.53 | 101 |
| 86.55 | 110 |
| 86.57 | 110 |
| 86.59 | 83 |
| 86.61 | 95 |
| 86.63 | 121 |
| 86.65 | 120 |
| 86.67 | 110 |
| 86.69 | 112 |
| 86.71 | 102 |
| 86.73 | 109 |
| 86.75 | 104 |
| 86.77 | 94 |
| 86.79 | 98 |
| 86.81 | 107 |
| 86.83 | 102 |
| 86.85 | 109 |
| 86.87 | 121 |
| 86.89 | 93 |
| 86.91 | 94 |
| 86.93 | 104 |
| 86.95 | 103 |
| 86.97 | 106 |
| 86.99 | 91 |
| 87.01 | 103 |
| 87.03 | 99 |
| 87.05 | 100 |
| 87.07 | 112 |
| 87.09 | 102 |
| 87.11 | 96 |
| 87.13 | 112 |
| 87.15 | 109 |
| 87.17 | 96 |
| 87.19 | 96 |
| 87.21 | 100 |
| 87.23 | 101 |
| 87.25 | 109 |
| 87.27 | 90 |
| 87.29 | 101 |
| 87.31 | 97 |
| 87.33 | 104 |
| 87.35 | 111 |
| 87.37 | 88 |
| 87.39 | 104 |
| 87.41 | 108 |
| 87.43 | 102 |
| 87.45 | 84 |
| 87.47 | 118 |
| 87.49 | 98 |
| 87.51 | 117 |
| 87.53 | 107 |
| 87.55 | 94 |
| 87.57 | 92 |
| 87.59 | 98 |
| 87.61 | 89 |
| 87.63 | 98 |
| 87.65 | 96 |
| 87.67 | 106 |
| 87.69 | 90 |
| 87.71 | 112 |
| 87.73 | 109 |
| 87.75 | 100 |
| 87.77 | 107 |
| 87.79 | 126 |
| 87.81 | 121 |
| 87.83 | 137 |
| 87.85 | 135 |
| 87.87 | 133 |
| 87.89 | 123 |
| 87.91 | 117 |
| 87.93 | 125 |
| 87.95 | 105 |
| 87.97 | 92 |
| 87.99 | 92 |
| 88.01 | 86 |
| 88.03 | 110 |
| 88.05 | 108 |
| 88.07 | 95 |
| 88.09 | 109 |
| 88.11 | 112 |
| 88.13 | 108 |
| 88.15 | 114 |
| 88.17 | 107 |
| 88.19 | 94 |
| 88.21 | 108 |
| 88.23 | 88 |
| 88.25 | 75 |
| 88.27 | 103 |
| 88.29 | 108 |
| 88.31 | 75 |
| 88.33 | 100 |
| 88.35 | 92 |
| 88.37 | 93 |
| 88.39 | 96 |
| 88.41 | 98 |
| 88.43 | 87 |
| 88.45 | 92 |
| 88.47 | 90 |
| 88.49 | 101 |
| 88.51 | 83 |
| 88.53 | 87 |
| 88.55 | 91 |
| 88.57 | 87 |
| 88.59 | 116 |
| 88.61 | 77 |
| 88.63 | 100 |
| 88.65 | 102 |
| 88.67 | 79 |
| 88.69 | 94 |
| 88.71 | 86 |
| 88.73 | 87 |
| 88.75 | 84 |
| 88.77 | 101 |
| 88.79 | 80 |
| 88.81 | 79 |
| 88.83 | 101 |
| 88.85 | 86 |
| 88.87 | 77 |
| 88.89 | 90 |
| 88.91 | 95 |
| 88.93 | 98 |
| 88.95 | 90 |
| 88.97 | 80 |
| 88.99 | 95 |
| 89.01 | 99 |
| 89.03 | 84 |
| 89.05 | 85 |
| 89.07 | 80 |
| 89.09 | 92 |
| 89.11 | 86 |
| 89.13 | 83 |
| 89.15 | 99 |
| 89.17 | 88 |
| 89.19 | 92 |
| 89.21 | 80 |
| 89.23 | 106 |
| 89.25 | 88 |
| 89.27 | 83 |
| 89.29 | 90 |
| 89.31 | 80 |
| 89.33 | 90 |
| 89.35 | 81 |
| 89.37 | 89 |
| 89.39 | 81 |
| 89.41 | 79 |
| 89.43 | 80 |
| 89.45 | 86 |
| 89.47 | 96 |
| 89.49 | 96 |
| 89.51 | 101 |
| 89.53 | 104 |
| 89.55 | 80 |
| 89.57 | 96 |
| 89.59 | 81 |
| 89.61 | 97 |
| 89.63 | 95 |
| 89.65 | 82 |
| 89.67 | 92 |
| 89.69 | 95 |
| 89.71 | 79 |
| 89.73 | 101 |
| 89.75 | 88 |
| 89.77 | 102 |
| 89.79 | 92 |
| 89.81 | 106 |
| 89.83 | 94 |
| 89.85 | 109 |
| 89.87 | 98 |
| 89.89 | 78 |
| 89.91 | 98 |
| 89.93 | 90 |
| 89.95 | 90 |
| 89.97 | 88 |
| 89.99 | 109 |